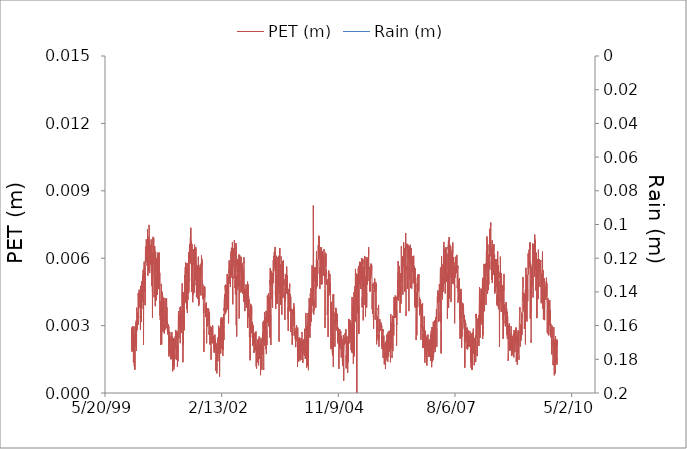
| Category | PET (m) |
|---|---|
| 36526.0 | 0.003 |
| 36527.0 | 0.003 |
| 36528.0 | 0.003 |
| 36529.0 | 0.002 |
| 36530.0 | 0.002 |
| 36531.0 | 0.003 |
| 36532.0 | 0.002 |
| 36533.0 | 0.003 |
| 36534.0 | 0.003 |
| 36535.0 | 0.002 |
| 36536.0 | 0.003 |
| 36537.0 | 0.003 |
| 36538.0 | 0.003 |
| 36539.0 | 0.002 |
| 36540.0 | 0.002 |
| 36541.0 | 0.002 |
| 36542.0 | 0.002 |
| 36543.0 | 0.002 |
| 36544.0 | 0.001 |
| 36545.0 | 0.003 |
| 36546.0 | 0.002 |
| 36547.0 | 0.002 |
| 36548.0 | 0.003 |
| 36549.0 | 0.002 |
| 36550.0 | 0.001 |
| 36551.0 | 0.001 |
| 36552.0 | 0.001 |
| 36553.0 | 0.001 |
| 36554.0 | 0.002 |
| 36555.0 | 0.003 |
| 36556.0 | 0.001 |
| 36557.0 | 0.002 |
| 36558.0 | 0.002 |
| 36559.0 | 0.003 |
| 36560.0 | 0.003 |
| 36561.0 | 0.002 |
| 36562.0 | 0.002 |
| 36563.0 | 0.003 |
| 36564.0 | 0.003 |
| 36565.0 | 0.003 |
| 36566.0 | 0.003 |
| 36567.0 | 0.003 |
| 36568.0 | 0.003 |
| 36569.0 | 0.003 |
| 36570.0 | 0.002 |
| 36571.0 | 0.003 |
| 36572.0 | 0.004 |
| 36573.0 | 0.004 |
| 36574.0 | 0.003 |
| 36575.0 | 0.003 |
| 36576.0 | 0.003 |
| 36577.0 | 0.003 |
| 36578.0 | 0.003 |
| 36579.0 | 0.003 |
| 36580.0 | 0.003 |
| 36581.0 | 0.004 |
| 36582.0 | 0.003 |
| 36583.0 | 0.003 |
| 36584.0 | 0.003 |
| 36585.0 | 0.004 |
| 36586.0 | 0.004 |
| 36587.0 | 0.004 |
| 36588.0 | 0.004 |
| 36589.0 | 0.004 |
| 36590.0 | 0.004 |
| 36591.0 | 0.004 |
| 36592.0 | 0.004 |
| 36593.0 | 0.005 |
| 36594.0 | 0.004 |
| 36595.0 | 0.004 |
| 36596.0 | 0.005 |
| 36597.0 | 0.004 |
| 36598.0 | 0.004 |
| 36599.0 | 0.004 |
| 36600.0 | 0.004 |
| 36601.0 | 0.004 |
| 36602.0 | 0.003 |
| 36603.0 | 0.003 |
| 36604.0 | 0.003 |
| 36605.0 | 0.005 |
| 36606.0 | 0.005 |
| 36607.0 | 0.004 |
| 36608.0 | 0.003 |
| 36609.0 | 0.004 |
| 36610.0 | 0.005 |
| 36611.0 | 0.003 |
| 36612.0 | 0.003 |
| 36613.0 | 0.004 |
| 36614.0 | 0.005 |
| 36615.0 | 0.004 |
| 36616.0 | 0.004 |
| 36617.0 | 0.004 |
| 36618.0 | 0.005 |
| 36619.0 | 0.004 |
| 36620.0 | 0.004 |
| 36621.0 | 0.004 |
| 36622.0 | 0.005 |
| 36623.0 | 0.005 |
| 36624.0 | 0.005 |
| 36625.0 | 0.004 |
| 36626.0 | 0.005 |
| 36627.0 | 0.005 |
| 36628.0 | 0.005 |
| 36629.0 | 0.005 |
| 36630.0 | 0.002 |
| 36631.0 | 0.004 |
| 36632.0 | 0.005 |
| 36633.0 | 0.005 |
| 36634.0 | 0.005 |
| 36635.0 | 0.006 |
| 36636.0 | 0.006 |
| 36637.0 | 0.005 |
| 36638.0 | 0.005 |
| 36639.0 | 0.005 |
| 36640.0 | 0.006 |
| 36641.0 | 0.005 |
| 36642.0 | 0.004 |
| 36643.0 | 0.005 |
| 36644.0 | 0.004 |
| 36645.0 | 0.005 |
| 36646.0 | 0.006 |
| 36647.0 | 0.007 |
| 36648.0 | 0.006 |
| 36649.0 | 0.006 |
| 36650.0 | 0.006 |
| 36651.0 | 0.006 |
| 36652.0 | 0.006 |
| 36653.0 | 0.006 |
| 36654.0 | 0.007 |
| 36655.0 | 0.006 |
| 36656.0 | 0.006 |
| 36657.0 | 0.006 |
| 36658.0 | 0.007 |
| 36659.0 | 0.007 |
| 36660.0 | 0.006 |
| 36661.0 | 0.006 |
| 36662.0 | 0.006 |
| 36663.0 | 0.007 |
| 36664.0 | 0.007 |
| 36665.0 | 0.007 |
| 36666.0 | 0.007 |
| 36667.0 | 0.006 |
| 36668.0 | 0.005 |
| 36669.0 | 0.006 |
| 36670.0 | 0.006 |
| 36671.0 | 0.006 |
| 36672.0 | 0.006 |
| 36673.0 | 0.007 |
| 36674.0 | 0.006 |
| 36675.0 | 0.006 |
| 36676.0 | 0.005 |
| 36677.0 | 0.006 |
| 36678.0 | 0.007 |
| 36679.0 | 0.007 |
| 36680.0 | 0.007 |
| 36681.0 | 0.007 |
| 36682.0 | 0.006 |
| 36683.0 | 0.005 |
| 36684.0 | 0.006 |
| 36685.0 | 0.007 |
| 36686.0 | 0.007 |
| 36687.0 | 0.007 |
| 36688.0 | 0.006 |
| 36689.0 | 0.006 |
| 36690.0 | 0.007 |
| 36691.0 | 0.006 |
| 36692.0 | 0.006 |
| 36693.0 | 0.007 |
| 36694.0 | 0.006 |
| 36695.0 | 0.006 |
| 36696.0 | 0.007 |
| 36697.0 | 0.006 |
| 36698.0 | 0.006 |
| 36699.0 | 0.005 |
| 36700.0 | 0.005 |
| 36701.0 | 0.006 |
| 36702.0 | 0.006 |
| 36703.0 | 0.005 |
| 36704.0 | 0.005 |
| 36705.0 | 0.006 |
| 36706.0 | 0.004 |
| 36707.0 | 0.003 |
| 36708.0 | 0.006 |
| 36709.0 | 0.006 |
| 36710.0 | 0.006 |
| 36711.0 | 0.006 |
| 36712.0 | 0.007 |
| 36713.0 | 0.006 |
| 36714.0 | 0.007 |
| 36715.0 | 0.006 |
| 36716.0 | 0.006 |
| 36717.0 | 0.007 |
| 36718.0 | 0.007 |
| 36719.0 | 0.005 |
| 36720.0 | 0.005 |
| 36721.0 | 0.004 |
| 36722.0 | 0.006 |
| 36723.0 | 0.006 |
| 36724.0 | 0.005 |
| 36725.0 | 0.006 |
| 36726.0 | 0.007 |
| 36727.0 | 0.006 |
| 36728.0 | 0.005 |
| 36729.0 | 0.005 |
| 36730.0 | 0.004 |
| 36731.0 | 0.004 |
| 36732.0 | 0.005 |
| 36733.0 | 0.006 |
| 36734.0 | 0.006 |
| 36735.0 | 0.006 |
| 36736.0 | 0.006 |
| 36737.0 | 0.006 |
| 36738.0 | 0.005 |
| 36739.0 | 0.005 |
| 36740.0 | 0.005 |
| 36741.0 | 0.004 |
| 36742.0 | 0.005 |
| 36743.0 | 0.006 |
| 36744.0 | 0.005 |
| 36745.0 | 0.006 |
| 36746.0 | 0.006 |
| 36747.0 | 0.006 |
| 36748.0 | 0.006 |
| 36749.0 | 0.005 |
| 36750.0 | 0.004 |
| 36751.0 | 0.005 |
| 36752.0 | 0.006 |
| 36753.0 | 0.006 |
| 36754.0 | 0.006 |
| 36755.0 | 0.006 |
| 36756.0 | 0.006 |
| 36757.0 | 0.005 |
| 36758.0 | 0.005 |
| 36759.0 | 0.005 |
| 36760.0 | 0.005 |
| 36761.0 | 0.006 |
| 36762.0 | 0.006 |
| 36763.0 | 0.006 |
| 36764.0 | 0.006 |
| 36765.0 | 0.006 |
| 36766.0 | 0.006 |
| 36767.0 | 0.005 |
| 36768.0 | 0.005 |
| 36769.0 | 0.005 |
| 36770.0 | 0.004 |
| 36771.0 | 0.003 |
| 36772.0 | 0.004 |
| 36773.0 | 0.004 |
| 36774.0 | 0.003 |
| 36775.0 | 0.004 |
| 36776.0 | 0.004 |
| 36777.0 | 0.004 |
| 36778.0 | 0.002 |
| 36779.0 | 0.004 |
| 36780.0 | 0.004 |
| 36781.0 | 0.005 |
| 36782.0 | 0.005 |
| 36783.0 | 0.005 |
| 36784.0 | 0.005 |
| 36785.0 | 0.004 |
| 36786.0 | 0.002 |
| 36787.0 | 0.003 |
| 36788.0 | 0.004 |
| 36789.0 | 0.005 |
| 36790.0 | 0.004 |
| 36791.0 | 0.003 |
| 36792.0 | 0.004 |
| 36793.0 | 0.004 |
| 36794.0 | 0.004 |
| 36795.0 | 0.004 |
| 36796.0 | 0.003 |
| 36797.0 | 0.004 |
| 36798.0 | 0.004 |
| 36799.0 | 0.003 |
| 36800.0 | 0.004 |
| 36801.0 | 0.004 |
| 36802.0 | 0.004 |
| 36803.0 | 0.004 |
| 36804.0 | 0.004 |
| 36805.0 | 0.004 |
| 36806.0 | 0.003 |
| 36807.0 | 0.003 |
| 36808.0 | 0.003 |
| 36809.0 | 0.003 |
| 36810.0 | 0.003 |
| 36811.0 | 0.004 |
| 36812.0 | 0.004 |
| 36813.0 | 0.004 |
| 36814.0 | 0.004 |
| 36815.0 | 0.004 |
| 36816.0 | 0.004 |
| 36817.0 | 0.004 |
| 36818.0 | 0.004 |
| 36819.0 | 0.003 |
| 36820.0 | 0.003 |
| 36821.0 | 0.003 |
| 36822.0 | 0.003 |
| 36823.0 | 0.003 |
| 36824.0 | 0.003 |
| 36825.0 | 0.004 |
| 36826.0 | 0.003 |
| 36827.0 | 0.004 |
| 36828.0 | 0.004 |
| 36829.0 | 0.003 |
| 36830.0 | 0.004 |
| 36831.0 | 0.003 |
| 36832.0 | 0.003 |
| 36833.0 | 0.003 |
| 36834.0 | 0.003 |
| 36835.0 | 0.003 |
| 36836.0 | 0.003 |
| 36837.0 | 0.003 |
| 36838.0 | 0.003 |
| 36839.0 | 0.003 |
| 36840.0 | 0.003 |
| 36841.0 | 0.003 |
| 36842.0 | 0.003 |
| 36843.0 | 0.003 |
| 36844.0 | 0.003 |
| 36845.0 | 0.002 |
| 36846.0 | 0.003 |
| 36847.0 | 0.003 |
| 36848.0 | 0.002 |
| 36849.0 | 0.003 |
| 36850.0 | 0.002 |
| 36851.0 | 0.002 |
| 36852.0 | 0.002 |
| 36853.0 | 0.002 |
| 36854.0 | 0.003 |
| 36855.0 | 0.002 |
| 36856.0 | 0.002 |
| 36857.0 | 0.002 |
| 36858.0 | 0.003 |
| 36859.0 | 0.002 |
| 36860.0 | 0.002 |
| 36861.0 | 0.002 |
| 36862.0 | 0.002 |
| 36863.0 | 0.002 |
| 36864.0 | 0.001 |
| 36865.0 | 0.002 |
| 36866.0 | 0.002 |
| 36867.0 | 0.002 |
| 36868.0 | 0.003 |
| 36869.0 | 0.002 |
| 36870.0 | 0.002 |
| 36871.0 | 0.002 |
| 36872.0 | 0.002 |
| 36873.0 | 0.003 |
| 36874.0 | 0.002 |
| 36875.0 | 0.002 |
| 36876.0 | 0.002 |
| 36877.0 | 0.002 |
| 36878.0 | 0.002 |
| 36879.0 | 0.001 |
| 36880.0 | 0.001 |
| 36881.0 | 0.002 |
| 36882.0 | 0.002 |
| 36883.0 | 0.002 |
| 36884.0 | 0.002 |
| 36885.0 | 0.002 |
| 36886.0 | 0.002 |
| 36887.0 | 0.002 |
| 36888.0 | 0.002 |
| 36889.0 | 0.001 |
| 36890.0 | 0.001 |
| 36891.0 | 0.001 |
| 36892.0 | 0.002 |
| 36893.0 | 0.001 |
| 36894.0 | 0.002 |
| 36895.0 | 0.001 |
| 36896.0 | 0.002 |
| 36897.0 | 0.002 |
| 36898.0 | 0.002 |
| 36899.0 | 0.002 |
| 36900.0 | 0.002 |
| 36901.0 | 0.002 |
| 36902.0 | 0.003 |
| 36903.0 | 0.002 |
| 36904.0 | 0.002 |
| 36905.0 | 0.002 |
| 36906.0 | 0.003 |
| 36907.0 | 0.003 |
| 36908.0 | 0.003 |
| 36909.0 | 0.002 |
| 36910.0 | 0.003 |
| 36911.0 | 0.002 |
| 36912.0 | 0.001 |
| 36913.0 | 0.002 |
| 36914.0 | 0.002 |
| 36915.0 | 0.002 |
| 36916.0 | 0.002 |
| 36917.0 | 0.002 |
| 36918.0 | 0.003 |
| 36919.0 | 0.003 |
| 36920.0 | 0.003 |
| 36921.0 | 0.001 |
| 36922.0 | 0.001 |
| 36923.0 | 0.001 |
| 36924.0 | 0.002 |
| 36925.0 | 0.002 |
| 36926.0 | 0.001 |
| 36927.0 | 0.003 |
| 36928.0 | 0.003 |
| 36929.0 | 0.004 |
| 36930.0 | 0.004 |
| 36931.0 | 0.004 |
| 36932.0 | 0.003 |
| 36933.0 | 0.002 |
| 36934.0 | 0.003 |
| 36935.0 | 0.003 |
| 36936.0 | 0.003 |
| 36937.0 | 0.004 |
| 36938.0 | 0.004 |
| 36939.0 | 0.003 |
| 36940.0 | 0.003 |
| 36941.0 | 0.003 |
| 36942.0 | 0.004 |
| 36943.0 | 0.004 |
| 36944.0 | 0.003 |
| 36945.0 | 0.002 |
| 36946.0 | 0.003 |
| 36947.0 | 0.003 |
| 36948.0 | 0.003 |
| 36949.0 | 0.004 |
| 36950.0 | 0.004 |
| 36951.0 | 0.003 |
| 36952.0 | 0.003 |
| 36953.0 | 0.004 |
| 36954.0 | 0.003 |
| 36955.0 | 0.003 |
| 36956.0 | 0.003 |
| 36957.0 | 0.003 |
| 36958.0 | 0.004 |
| 36959.0 | 0.004 |
| 36960.0 | 0.003 |
| 36961.0 | 0.004 |
| 36962.0 | 0.005 |
| 36963.0 | 0.004 |
| 36964.0 | 0.004 |
| 36965.0 | 0.004 |
| 36966.0 | 0.004 |
| 36967.0 | 0.003 |
| 36968.0 | 0.001 |
| 36969.0 | 0.002 |
| 36970.0 | 0.003 |
| 36971.0 | 0.002 |
| 36972.0 | 0.004 |
| 36973.0 | 0.004 |
| 36974.0 | 0.004 |
| 36975.0 | 0.003 |
| 36976.0 | 0.003 |
| 36977.0 | 0.003 |
| 36978.0 | 0.004 |
| 36979.0 | 0.003 |
| 36980.0 | 0.003 |
| 36981.0 | 0.004 |
| 36982.0 | 0.005 |
| 36983.0 | 0.005 |
| 36984.0 | 0.005 |
| 36985.0 | 0.005 |
| 36986.0 | 0.004 |
| 36987.0 | 0.005 |
| 36988.0 | 0.006 |
| 36989.0 | 0.005 |
| 36990.0 | 0.005 |
| 36991.0 | 0.005 |
| 36992.0 | 0.006 |
| 36993.0 | 0.006 |
| 36994.0 | 0.005 |
| 36995.0 | 0.004 |
| 36996.0 | 0.005 |
| 36997.0 | 0.005 |
| 36998.0 | 0.005 |
| 36999.0 | 0.004 |
| 37000.0 | 0.005 |
| 37001.0 | 0.006 |
| 37002.0 | 0.005 |
| 37003.0 | 0.005 |
| 37004.0 | 0.006 |
| 37005.0 | 0.005 |
| 37006.0 | 0.004 |
| 37007.0 | 0.004 |
| 37008.0 | 0.005 |
| 37009.0 | 0.005 |
| 37010.0 | 0.005 |
| 37011.0 | 0.004 |
| 37012.0 | 0.005 |
| 37013.0 | 0.005 |
| 37014.0 | 0.005 |
| 37015.0 | 0.005 |
| 37016.0 | 0.006 |
| 37017.0 | 0.006 |
| 37018.0 | 0.004 |
| 37019.0 | 0.005 |
| 37020.0 | 0.005 |
| 37021.0 | 0.006 |
| 37022.0 | 0.006 |
| 37023.0 | 0.006 |
| 37024.0 | 0.006 |
| 37025.0 | 0.007 |
| 37026.0 | 0.006 |
| 37027.0 | 0.007 |
| 37028.0 | 0.006 |
| 37029.0 | 0.006 |
| 37030.0 | 0.007 |
| 37031.0 | 0.006 |
| 37032.0 | 0.007 |
| 37033.0 | 0.006 |
| 37034.0 | 0.006 |
| 37035.0 | 0.007 |
| 37036.0 | 0.007 |
| 37037.0 | 0.006 |
| 37038.0 | 0.007 |
| 37039.0 | 0.007 |
| 37040.0 | 0.006 |
| 37041.0 | 0.005 |
| 37042.0 | 0.006 |
| 37043.0 | 0.005 |
| 37044.0 | 0.006 |
| 37045.0 | 0.006 |
| 37046.0 | 0.007 |
| 37047.0 | 0.007 |
| 37048.0 | 0.006 |
| 37049.0 | 0.006 |
| 37050.0 | 0.006 |
| 37051.0 | 0.005 |
| 37052.0 | 0.004 |
| 37053.0 | 0.005 |
| 37054.0 | 0.004 |
| 37055.0 | 0.005 |
| 37056.0 | 0.006 |
| 37057.0 | 0.006 |
| 37058.0 | 0.006 |
| 37059.0 | 0.006 |
| 37060.0 | 0.006 |
| 37061.0 | 0.006 |
| 37062.0 | 0.006 |
| 37063.0 | 0.006 |
| 37064.0 | 0.005 |
| 37065.0 | 0.004 |
| 37066.0 | 0.006 |
| 37067.0 | 0.006 |
| 37068.0 | 0.007 |
| 37069.0 | 0.006 |
| 37070.0 | 0.005 |
| 37071.0 | 0.005 |
| 37072.0 | 0.005 |
| 37073.0 | 0.006 |
| 37074.0 | 0.006 |
| 37075.0 | 0.006 |
| 37076.0 | 0.005 |
| 37077.0 | 0.006 |
| 37078.0 | 0.006 |
| 37079.0 | 0.006 |
| 37080.0 | 0.005 |
| 37081.0 | 0.006 |
| 37082.0 | 0.005 |
| 37083.0 | 0.004 |
| 37084.0 | 0.004 |
| 37085.0 | 0.005 |
| 37086.0 | 0.005 |
| 37087.0 | 0.005 |
| 37088.0 | 0.006 |
| 37089.0 | 0.006 |
| 37090.0 | 0.005 |
| 37091.0 | 0.005 |
| 37092.0 | 0.005 |
| 37093.0 | 0.004 |
| 37094.0 | 0.005 |
| 37095.0 | 0.005 |
| 37096.0 | 0.004 |
| 37097.0 | 0.006 |
| 37098.0 | 0.005 |
| 37099.0 | 0.005 |
| 37100.0 | 0.006 |
| 37101.0 | 0.006 |
| 37102.0 | 0.005 |
| 37103.0 | 0.004 |
| 37104.0 | 0.005 |
| 37105.0 | 0.004 |
| 37106.0 | 0.004 |
| 37107.0 | 0.005 |
| 37108.0 | 0.005 |
| 37109.0 | 0.005 |
| 37110.0 | 0.005 |
| 37111.0 | 0.006 |
| 37112.0 | 0.005 |
| 37113.0 | 0.005 |
| 37114.0 | 0.005 |
| 37115.0 | 0.006 |
| 37116.0 | 0.006 |
| 37117.0 | 0.005 |
| 37118.0 | 0.005 |
| 37119.0 | 0.006 |
| 37120.0 | 0.005 |
| 37121.0 | 0.005 |
| 37122.0 | 0.004 |
| 37123.0 | 0.005 |
| 37124.0 | 0.006 |
| 37125.0 | 0.006 |
| 37126.0 | 0.005 |
| 37127.0 | 0.006 |
| 37128.0 | 0.006 |
| 37129.0 | 0.006 |
| 37130.0 | 0.006 |
| 37131.0 | 0.006 |
| 37132.0 | 0.006 |
| 37133.0 | 0.006 |
| 37134.0 | 0.006 |
| 37135.0 | 0.005 |
| 37136.0 | 0.005 |
| 37137.0 | 0.004 |
| 37138.0 | 0.005 |
| 37139.0 | 0.005 |
| 37140.0 | 0.004 |
| 37141.0 | 0.004 |
| 37142.0 | 0.004 |
| 37143.0 | 0.004 |
| 37144.0 | 0.004 |
| 37145.0 | 0.004 |
| 37146.0 | 0.004 |
| 37147.0 | 0.003 |
| 37148.0 | 0.002 |
| 37149.0 | 0.003 |
| 37150.0 | 0.005 |
| 37151.0 | 0.005 |
| 37152.0 | 0.005 |
| 37153.0 | 0.005 |
| 37154.0 | 0.004 |
| 37155.0 | 0.005 |
| 37156.0 | 0.004 |
| 37157.0 | 0.004 |
| 37158.0 | 0.004 |
| 37159.0 | 0.004 |
| 37160.0 | 0.004 |
| 37161.0 | 0.004 |
| 37162.0 | 0.004 |
| 37163.0 | 0.003 |
| 37164.0 | 0.004 |
| 37165.0 | 0.004 |
| 37166.0 | 0.004 |
| 37167.0 | 0.004 |
| 37168.0 | 0.004 |
| 37169.0 | 0.004 |
| 37170.0 | 0.003 |
| 37171.0 | 0.002 |
| 37172.0 | 0.003 |
| 37173.0 | 0.003 |
| 37174.0 | 0.003 |
| 37175.0 | 0.003 |
| 37176.0 | 0.004 |
| 37177.0 | 0.003 |
| 37178.0 | 0.003 |
| 37179.0 | 0.003 |
| 37180.0 | 0.003 |
| 37181.0 | 0.003 |
| 37182.0 | 0.004 |
| 37183.0 | 0.004 |
| 37184.0 | 0.003 |
| 37185.0 | 0.003 |
| 37186.0 | 0.003 |
| 37187.0 | 0.003 |
| 37188.0 | 0.003 |
| 37189.0 | 0.004 |
| 37190.0 | 0.004 |
| 37191.0 | 0.003 |
| 37192.0 | 0.003 |
| 37193.0 | 0.003 |
| 37194.0 | 0.003 |
| 37195.0 | 0.003 |
| 37196.0 | 0.004 |
| 37197.0 | 0.003 |
| 37198.0 | 0.003 |
| 37199.0 | 0.002 |
| 37200.0 | 0.003 |
| 37201.0 | 0.003 |
| 37202.0 | 0.003 |
| 37203.0 | 0.003 |
| 37204.0 | 0.003 |
| 37205.0 | 0.003 |
| 37206.0 | 0.003 |
| 37207.0 | 0.003 |
| 37208.0 | 0.002 |
| 37209.0 | 0.001 |
| 37210.0 | 0.002 |
| 37211.0 | 0.003 |
| 37212.0 | 0.003 |
| 37213.0 | 0.003 |
| 37214.0 | 0.003 |
| 37215.0 | 0.003 |
| 37216.0 | 0.003 |
| 37217.0 | 0.003 |
| 37218.0 | 0.002 |
| 37219.0 | 0.003 |
| 37220.0 | 0.003 |
| 37221.0 | 0.003 |
| 37222.0 | 0.003 |
| 37223.0 | 0.003 |
| 37224.0 | 0.003 |
| 37225.0 | 0.003 |
| 37226.0 | 0.002 |
| 37227.0 | 0.003 |
| 37228.0 | 0.002 |
| 37229.0 | 0.002 |
| 37230.0 | 0.002 |
| 37231.0 | 0.003 |
| 37232.0 | 0.003 |
| 37233.0 | 0.002 |
| 37234.0 | 0.002 |
| 37235.0 | 0.002 |
| 37236.0 | 0.002 |
| 37237.0 | 0.002 |
| 37238.0 | 0.002 |
| 37239.0 | 0.002 |
| 37240.0 | 0.002 |
| 37241.0 | 0.002 |
| 37242.0 | 0.003 |
| 37243.0 | 0.002 |
| 37244.0 | 0.002 |
| 37245.0 | 0.002 |
| 37246.0 | 0.002 |
| 37247.0 | 0.002 |
| 37248.0 | 0.002 |
| 37249.0 | 0.002 |
| 37250.0 | 0.001 |
| 37251.0 | 0.001 |
| 37252.0 | 0.002 |
| 37253.0 | 0.002 |
| 37254.0 | 0.002 |
| 37255.0 | 0.002 |
| 37256.0 | 0.002 |
| 37257.0 | 0.002 |
| 37258.0 | 0.001 |
| 37259.0 | 0.001 |
| 37260.0 | 0.001 |
| 37261.0 | 0.002 |
| 37262.0 | 0.002 |
| 37263.0 | 0.001 |
| 37264.0 | 0.001 |
| 37265.0 | 0.002 |
| 37266.0 | 0.002 |
| 37267.0 | 0.002 |
| 37268.0 | 0.002 |
| 37269.0 | 0.002 |
| 37270.0 | 0.002 |
| 37271.0 | 0.002 |
| 37272.0 | 0.002 |
| 37273.0 | 0.003 |
| 37274.0 | 0.003 |
| 37275.0 | 0.003 |
| 37276.0 | 0.002 |
| 37277.0 | 0.002 |
| 37278.0 | 0.001 |
| 37279.0 | 0.003 |
| 37280.0 | 0.003 |
| 37281.0 | 0.002 |
| 37282.0 | 0.001 |
| 37283.0 | 0.002 |
| 37284.0 | 0.002 |
| 37285.0 | 0.002 |
| 37286.0 | 0.002 |
| 37287.0 | 0.002 |
| 37288.0 | 0.003 |
| 37289.0 | 0.003 |
| 37290.0 | 0.003 |
| 37291.0 | 0.002 |
| 37292.0 | 0.002 |
| 37293.0 | 0.003 |
| 37294.0 | 0.003 |
| 37295.0 | 0.002 |
| 37296.0 | 0.003 |
| 37297.0 | 0.002 |
| 37298.0 | 0.003 |
| 37299.0 | 0.003 |
| 37300.0 | 0.002 |
| 37301.0 | 0.002 |
| 37302.0 | 0.003 |
| 37303.0 | 0.003 |
| 37304.0 | 0.003 |
| 37305.0 | 0.003 |
| 37306.0 | 0.003 |
| 37307.0 | 0.003 |
| 37308.0 | 0.003 |
| 37309.0 | 0.002 |
| 37310.0 | 0.002 |
| 37311.0 | 0.003 |
| 37312.0 | 0.003 |
| 37313.0 | 0.003 |
| 37314.0 | 0.003 |
| 37315.0 | 0.002 |
| 37316.0 | 0.003 |
| 37317.0 | 0.003 |
| 37318.0 | 0.004 |
| 37319.0 | 0.002 |
| 37320.0 | 0.003 |
| 37321.0 | 0.004 |
| 37322.0 | 0.004 |
| 37323.0 | 0.004 |
| 37324.0 | 0.004 |
| 37325.0 | 0.004 |
| 37326.0 | 0.004 |
| 37327.0 | 0.004 |
| 37328.0 | 0.003 |
| 37329.0 | 0.004 |
| 37330.0 | 0.005 |
| 37331.0 | 0.005 |
| 37332.0 | 0.005 |
| 37333.0 | 0.005 |
| 37334.0 | 0.005 |
| 37335.0 | 0.004 |
| 37336.0 | 0.004 |
| 37337.0 | 0.004 |
| 37338.0 | 0.004 |
| 37339.0 | 0.005 |
| 37340.0 | 0.005 |
| 37341.0 | 0.005 |
| 37342.0 | 0.004 |
| 37343.0 | 0.005 |
| 37344.0 | 0.005 |
| 37345.0 | 0.005 |
| 37346.0 | 0.004 |
| 37347.0 | 0.004 |
| 37348.0 | 0.005 |
| 37349.0 | 0.004 |
| 37350.0 | 0.004 |
| 37351.0 | 0.004 |
| 37352.0 | 0.005 |
| 37353.0 | 0.005 |
| 37354.0 | 0.005 |
| 37355.0 | 0.005 |
| 37356.0 | 0.004 |
| 37357.0 | 0.004 |
| 37358.0 | 0.004 |
| 37359.0 | 0.003 |
| 37360.0 | 0.005 |
| 37361.0 | 0.005 |
| 37362.0 | 0.005 |
| 37363.0 | 0.005 |
| 37364.0 | 0.005 |
| 37365.0 | 0.006 |
| 37366.0 | 0.005 |
| 37367.0 | 0.006 |
| 37368.0 | 0.006 |
| 37369.0 | 0.005 |
| 37370.0 | 0.006 |
| 37371.0 | 0.005 |
| 37372.0 | 0.005 |
| 37373.0 | 0.005 |
| 37374.0 | 0.005 |
| 37375.0 | 0.005 |
| 37376.0 | 0.005 |
| 37377.0 | 0.005 |
| 37378.0 | 0.005 |
| 37379.0 | 0.006 |
| 37380.0 | 0.006 |
| 37381.0 | 0.005 |
| 37382.0 | 0.005 |
| 37383.0 | 0.006 |
| 37384.0 | 0.006 |
| 37385.0 | 0.006 |
| 37386.0 | 0.006 |
| 37387.0 | 0.006 |
| 37388.0 | 0.006 |
| 37389.0 | 0.005 |
| 37390.0 | 0.006 |
| 37391.0 | 0.006 |
| 37392.0 | 0.007 |
| 37393.0 | 0.006 |
| 37394.0 | 0.005 |
| 37395.0 | 0.004 |
| 37396.0 | 0.005 |
| 37397.0 | 0.005 |
| 37398.0 | 0.005 |
| 37399.0 | 0.005 |
| 37400.0 | 0.006 |
| 37401.0 | 0.006 |
| 37402.0 | 0.006 |
| 37403.0 | 0.006 |
| 37404.0 | 0.006 |
| 37405.0 | 0.006 |
| 37406.0 | 0.006 |
| 37407.0 | 0.006 |
| 37408.0 | 0.007 |
| 37409.0 | 0.007 |
| 37410.0 | 0.007 |
| 37411.0 | 0.006 |
| 37412.0 | 0.006 |
| 37413.0 | 0.005 |
| 37414.0 | 0.006 |
| 37415.0 | 0.005 |
| 37416.0 | 0.005 |
| 37417.0 | 0.005 |
| 37418.0 | 0.004 |
| 37419.0 | 0.006 |
| 37420.0 | 0.006 |
| 37421.0 | 0.006 |
| 37422.0 | 0.006 |
| 37423.0 | 0.007 |
| 37424.0 | 0.005 |
| 37425.0 | 0.003 |
| 37426.0 | 0.005 |
| 37427.0 | 0.005 |
| 37428.0 | 0.003 |
| 37429.0 | 0.003 |
| 37430.0 | 0.005 |
| 37431.0 | 0.005 |
| 37432.0 | 0.005 |
| 37433.0 | 0.005 |
| 37434.0 | 0.005 |
| 37435.0 | 0.006 |
| 37436.0 | 0.005 |
| 37437.0 | 0.005 |
| 37438.0 | 0.006 |
| 37439.0 | 0.006 |
| 37440.0 | 0.006 |
| 37441.0 | 0.005 |
| 37442.0 | 0.005 |
| 37443.0 | 0.006 |
| 37444.0 | 0.006 |
| 37445.0 | 0.005 |
| 37446.0 | 0.005 |
| 37447.0 | 0.005 |
| 37448.0 | 0.006 |
| 37449.0 | 0.005 |
| 37450.0 | 0.003 |
| 37451.0 | 0.005 |
| 37452.0 | 0.005 |
| 37453.0 | 0.006 |
| 37454.0 | 0.006 |
| 37455.0 | 0.006 |
| 37456.0 | 0.006 |
| 37457.0 | 0.005 |
| 37458.0 | 0.004 |
| 37459.0 | 0.005 |
| 37460.0 | 0.005 |
| 37461.0 | 0.005 |
| 37462.0 | 0.006 |
| 37463.0 | 0.006 |
| 37464.0 | 0.006 |
| 37465.0 | 0.006 |
| 37466.0 | 0.006 |
| 37467.0 | 0.006 |
| 37468.0 | 0.006 |
| 37469.0 | 0.005 |
| 37470.0 | 0.005 |
| 37471.0 | 0.005 |
| 37472.0 | 0.004 |
| 37473.0 | 0.005 |
| 37474.0 | 0.006 |
| 37475.0 | 0.005 |
| 37476.0 | 0.006 |
| 37477.0 | 0.006 |
| 37478.0 | 0.005 |
| 37479.0 | 0.006 |
| 37480.0 | 0.005 |
| 37481.0 | 0.004 |
| 37482.0 | 0.006 |
| 37483.0 | 0.005 |
| 37484.0 | 0.005 |
| 37485.0 | 0.005 |
| 37486.0 | 0.005 |
| 37487.0 | 0.005 |
| 37488.0 | 0.004 |
| 37489.0 | 0.005 |
| 37490.0 | 0.006 |
| 37491.0 | 0.006 |
| 37492.0 | 0.006 |
| 37493.0 | 0.006 |
| 37494.0 | 0.004 |
| 37495.0 | 0.004 |
| 37496.0 | 0.004 |
| 37497.0 | 0.005 |
| 37498.0 | 0.004 |
| 37499.0 | 0.004 |
| 37500.0 | 0.005 |
| 37501.0 | 0.004 |
| 37502.0 | 0.004 |
| 37503.0 | 0.004 |
| 37504.0 | 0.004 |
| 37505.0 | 0.004 |
| 37506.0 | 0.004 |
| 37507.0 | 0.004 |
| 37508.0 | 0.004 |
| 37509.0 | 0.005 |
| 37510.0 | 0.004 |
| 37511.0 | 0.004 |
| 37512.0 | 0.004 |
| 37513.0 | 0.004 |
| 37514.0 | 0.004 |
| 37515.0 | 0.005 |
| 37516.0 | 0.005 |
| 37517.0 | 0.005 |
| 37518.0 | 0.005 |
| 37519.0 | 0.004 |
| 37520.0 | 0.004 |
| 37521.0 | 0.005 |
| 37522.0 | 0.005 |
| 37523.0 | 0.003 |
| 37524.0 | 0.004 |
| 37525.0 | 0.004 |
| 37526.0 | 0.004 |
| 37527.0 | 0.005 |
| 37528.0 | 0.005 |
| 37529.0 | 0.004 |
| 37530.0 | 0.003 |
| 37531.0 | 0.004 |
| 37532.0 | 0.004 |
| 37533.0 | 0.004 |
| 37534.0 | 0.004 |
| 37535.0 | 0.004 |
| 37536.0 | 0.004 |
| 37537.0 | 0.004 |
| 37538.0 | 0.002 |
| 37539.0 | 0.003 |
| 37540.0 | 0.003 |
| 37541.0 | 0.004 |
| 37542.0 | 0.003 |
| 37543.0 | 0.003 |
| 37544.0 | 0.001 |
| 37545.0 | 0.003 |
| 37546.0 | 0.003 |
| 37547.0 | 0.003 |
| 37548.0 | 0.004 |
| 37549.0 | 0.004 |
| 37550.0 | 0.004 |
| 37551.0 | 0.004 |
| 37552.0 | 0.003 |
| 37553.0 | 0.003 |
| 37554.0 | 0.003 |
| 37555.0 | 0.003 |
| 37556.0 | 0.003 |
| 37557.0 | 0.004 |
| 37558.0 | 0.003 |
| 37559.0 | 0.003 |
| 37560.0 | 0.003 |
| 37561.0 | 0.003 |
| 37562.0 | 0.003 |
| 37563.0 | 0.002 |
| 37564.0 | 0.003 |
| 37565.0 | 0.003 |
| 37566.0 | 0.003 |
| 37567.0 | 0.002 |
| 37568.0 | 0.003 |
| 37569.0 | 0.003 |
| 37570.0 | 0.002 |
| 37571.0 | 0.002 |
| 37572.0 | 0.003 |
| 37573.0 | 0.002 |
| 37574.0 | 0.003 |
| 37575.0 | 0.002 |
| 37576.0 | 0.002 |
| 37577.0 | 0.002 |
| 37578.0 | 0.002 |
| 37579.0 | 0.002 |
| 37580.0 | 0.003 |
| 37581.0 | 0.002 |
| 37582.0 | 0.002 |
| 37583.0 | 0.002 |
| 37584.0 | 0.003 |
| 37585.0 | 0.002 |
| 37586.0 | 0.003 |
| 37587.0 | 0.003 |
| 37588.0 | 0.002 |
| 37589.0 | 0.002 |
| 37590.0 | 0.003 |
| 37591.0 | 0.002 |
| 37592.0 | 0.002 |
| 37593.0 | 0.002 |
| 37594.0 | 0.003 |
| 37595.0 | 0.002 |
| 37596.0 | 0.001 |
| 37597.0 | 0.002 |
| 37598.0 | 0.002 |
| 37599.0 | 0.001 |
| 37600.0 | 0.001 |
| 37601.0 | 0.002 |
| 37602.0 | 0.001 |
| 37603.0 | 0.002 |
| 37604.0 | 0.001 |
| 37605.0 | 0.001 |
| 37606.0 | 0.002 |
| 37607.0 | 0.002 |
| 37608.0 | 0.002 |
| 37609.0 | 0.002 |
| 37610.0 | 0.002 |
| 37611.0 | 0.002 |
| 37612.0 | 0.002 |
| 37613.0 | 0.002 |
| 37614.0 | 0.002 |
| 37615.0 | 0.002 |
| 37616.0 | 0.001 |
| 37617.0 | 0.002 |
| 37618.0 | 0.002 |
| 37619.0 | 0.002 |
| 37620.0 | 0.002 |
| 37621.0 | 0.003 |
| 37622.0 | 0.002 |
| 37623.0 | 0.002 |
| 37624.0 | 0.002 |
| 37625.0 | 0.002 |
| 37626.0 | 0.002 |
| 37627.0 | 0.002 |
| 37628.0 | 0.002 |
| 37629.0 | 0.002 |
| 37630.0 | 0.002 |
| 37631.0 | 0.002 |
| 37632.0 | 0.002 |
| 37633.0 | 0.001 |
| 37634.0 | 0.001 |
| 37635.0 | 0.002 |
| 37636.0 | 0.002 |
| 37637.0 | 0.002 |
| 37638.0 | 0.002 |
| 37639.0 | 0.001 |
| 37640.0 | 0.002 |
| 37641.0 | 0.002 |
| 37642.0 | 0.002 |
| 37643.0 | 0.002 |
| 37644.0 | 0.002 |
| 37645.0 | 0.001 |
| 37646.0 | 0.002 |
| 37647.0 | 0.002 |
| 37648.0 | 0.002 |
| 37649.0 | 0.002 |
| 37650.0 | 0.003 |
| 37651.0 | 0.003 |
| 37652.0 | 0.002 |
| 37653.0 | 0.002 |
| 37654.0 | 0.003 |
| 37655.0 | 0.003 |
| 37656.0 | 0.003 |
| 37657.0 | 0.002 |
| 37658.0 | 0.003 |
| 37659.0 | 0.003 |
| 37660.0 | 0.001 |
| 37661.0 | 0.001 |
| 37662.0 | 0.003 |
| 37663.0 | 0.002 |
| 37664.0 | 0.003 |
| 37665.0 | 0.003 |
| 37666.0 | 0.003 |
| 37667.0 | 0.004 |
| 37668.0 | 0.003 |
| 37669.0 | 0.002 |
| 37670.0 | 0.002 |
| 37671.0 | 0.003 |
| 37672.0 | 0.003 |
| 37673.0 | 0.003 |
| 37674.0 | 0.003 |
| 37675.0 | 0.003 |
| 37676.0 | 0.003 |
| 37677.0 | 0.003 |
| 37678.0 | 0.003 |
| 37679.0 | 0.003 |
| 37680.0 | 0.002 |
| 37681.0 | 0.004 |
| 37682.0 | 0.003 |
| 37683.0 | 0.002 |
| 37684.0 | 0.002 |
| 37685.0 | 0.004 |
| 37686.0 | 0.003 |
| 37687.0 | 0.003 |
| 37688.0 | 0.002 |
| 37689.0 | 0.003 |
| 37690.0 | 0.004 |
| 37691.0 | 0.004 |
| 37692.0 | 0.004 |
| 37693.0 | 0.004 |
| 37694.0 | 0.004 |
| 37695.0 | 0.003 |
| 37696.0 | 0.003 |
| 37697.0 | 0.003 |
| 37698.0 | 0.004 |
| 37699.0 | 0.004 |
| 37700.0 | 0.004 |
| 37701.0 | 0.004 |
| 37702.0 | 0.004 |
| 37703.0 | 0.003 |
| 37704.0 | 0.004 |
| 37705.0 | 0.004 |
| 37706.0 | 0.004 |
| 37707.0 | 0.003 |
| 37708.0 | 0.003 |
| 37709.0 | 0.004 |
| 37710.0 | 0.003 |
| 37711.0 | 0.002 |
| 37712.0 | 0.004 |
| 37713.0 | 0.005 |
| 37714.0 | 0.005 |
| 37715.0 | 0.005 |
| 37716.0 | 0.005 |
| 37717.0 | 0.006 |
| 37718.0 | 0.004 |
| 37719.0 | 0.004 |
| 37720.0 | 0.004 |
| 37721.0 | 0.002 |
| 37722.0 | 0.003 |
| 37723.0 | 0.005 |
| 37724.0 | 0.005 |
| 37725.0 | 0.005 |
| 37726.0 | 0.005 |
| 37727.0 | 0.005 |
| 37728.0 | 0.005 |
| 37729.0 | 0.005 |
| 37730.0 | 0.005 |
| 37731.0 | 0.004 |
| 37732.0 | 0.004 |
| 37733.0 | 0.005 |
| 37734.0 | 0.005 |
| 37735.0 | 0.005 |
| 37736.0 | 0.004 |
| 37737.0 | 0.005 |
| 37738.0 | 0.005 |
| 37739.0 | 0.005 |
| 37740.0 | 0.005 |
| 37741.0 | 0.005 |
| 37742.0 | 0.005 |
| 37743.0 | 0.006 |
| 37744.0 | 0.005 |
| 37745.0 | 0.006 |
| 37746.0 | 0.006 |
| 37747.0 | 0.006 |
| 37748.0 | 0.006 |
| 37749.0 | 0.006 |
| 37750.0 | 0.006 |
| 37751.0 | 0.006 |
| 37752.0 | 0.006 |
| 37753.0 | 0.006 |
| 37754.0 | 0.006 |
| 37755.0 | 0.006 |
| 37756.0 | 0.006 |
| 37757.0 | 0.006 |
| 37758.0 | 0.007 |
| 37759.0 | 0.005 |
| 37760.0 | 0.006 |
| 37761.0 | 0.004 |
| 37762.0 | 0.005 |
| 37763.0 | 0.004 |
| 37764.0 | 0.004 |
| 37765.0 | 0.005 |
| 37766.0 | 0.005 |
| 37767.0 | 0.006 |
| 37768.0 | 0.006 |
| 37769.0 | 0.005 |
| 37770.0 | 0.006 |
| 37771.0 | 0.006 |
| 37772.0 | 0.005 |
| 37773.0 | 0.004 |
| 37774.0 | 0.005 |
| 37775.0 | 0.005 |
| 37776.0 | 0.004 |
| 37777.0 | 0.005 |
| 37778.0 | 0.005 |
| 37779.0 | 0.005 |
| 37780.0 | 0.005 |
| 37781.0 | 0.006 |
| 37782.0 | 0.006 |
| 37783.0 | 0.006 |
| 37784.0 | 0.005 |
| 37785.0 | 0.005 |
| 37786.0 | 0.006 |
| 37787.0 | 0.006 |
| 37788.0 | 0.005 |
| 37789.0 | 0.005 |
| 37790.0 | 0.005 |
| 37791.0 | 0.004 |
| 37792.0 | 0.002 |
| 37793.0 | 0.005 |
| 37794.0 | 0.004 |
| 37795.0 | 0.005 |
| 37796.0 | 0.006 |
| 37797.0 | 0.006 |
| 37798.0 | 0.006 |
| 37799.0 | 0.006 |
| 37800.0 | 0.005 |
| 37801.0 | 0.005 |
| 37802.0 | 0.005 |
| 37803.0 | 0.005 |
| 37804.0 | 0.005 |
| 37805.0 | 0.004 |
| 37806.0 | 0.005 |
| 37807.0 | 0.006 |
| 37808.0 | 0.005 |
| 37809.0 | 0.005 |
| 37810.0 | 0.006 |
| 37811.0 | 0.006 |
| 37812.0 | 0.005 |
| 37813.0 | 0.005 |
| 37814.0 | 0.005 |
| 37815.0 | 0.003 |
| 37816.0 | 0.005 |
| 37817.0 | 0.004 |
| 37818.0 | 0.005 |
| 37819.0 | 0.005 |
| 37820.0 | 0.006 |
| 37821.0 | 0.006 |
| 37822.0 | 0.005 |
| 37823.0 | 0.005 |
| 37824.0 | 0.004 |
| 37825.0 | 0.005 |
| 37826.0 | 0.005 |
| 37827.0 | 0.005 |
| 37828.0 | 0.005 |
| 37829.0 | 0.006 |
| 37830.0 | 0.005 |
| 37831.0 | 0.005 |
| 37832.0 | 0.005 |
| 37833.0 | 0.005 |
| 37834.0 | 0.005 |
| 37835.0 | 0.004 |
| 37836.0 | 0.004 |
| 37837.0 | 0.004 |
| 37838.0 | 0.004 |
| 37839.0 | 0.004 |
| 37840.0 | 0.004 |
| 37841.0 | 0.004 |
| 37842.0 | 0.003 |
| 37843.0 | 0.004 |
| 37844.0 | 0.004 |
| 37845.0 | 0.004 |
| 37846.0 | 0.005 |
| 37847.0 | 0.004 |
| 37848.0 | 0.004 |
| 37849.0 | 0.005 |
| 37850.0 | 0.005 |
| 37851.0 | 0.005 |
| 37852.0 | 0.005 |
| 37853.0 | 0.005 |
| 37854.0 | 0.005 |
| 37855.0 | 0.004 |
| 37856.0 | 0.004 |
| 37857.0 | 0.006 |
| 37858.0 | 0.005 |
| 37859.0 | 0.005 |
| 37860.0 | 0.005 |
| 37861.0 | 0.005 |
| 37862.0 | 0.005 |
| 37863.0 | 0.005 |
| 37864.0 | 0.005 |
| 37865.0 | 0.004 |
| 37866.0 | 0.004 |
| 37867.0 | 0.004 |
| 37868.0 | 0.003 |
| 37869.0 | 0.003 |
| 37870.0 | 0.004 |
| 37871.0 | 0.003 |
| 37872.0 | 0.003 |
| 37873.0 | 0.004 |
| 37874.0 | 0.004 |
| 37875.0 | 0.004 |
| 37876.0 | 0.005 |
| 37877.0 | 0.005 |
| 37878.0 | 0.005 |
| 37879.0 | 0.004 |
| 37880.0 | 0.004 |
| 37881.0 | 0.004 |
| 37882.0 | 0.005 |
| 37883.0 | 0.005 |
| 37884.0 | 0.005 |
| 37885.0 | 0.004 |
| 37886.0 | 0.004 |
| 37887.0 | 0.004 |
| 37888.0 | 0.004 |
| 37889.0 | 0.004 |
| 37890.0 | 0.004 |
| 37891.0 | 0.004 |
| 37892.0 | 0.004 |
| 37893.0 | 0.003 |
| 37894.0 | 0.003 |
| 37895.0 | 0.003 |
| 37896.0 | 0.003 |
| 37897.0 | 0.003 |
| 37898.0 | 0.004 |
| 37899.0 | 0.004 |
| 37900.0 | 0.004 |
| 37901.0 | 0.003 |
| 37902.0 | 0.003 |
| 37903.0 | 0.003 |
| 37904.0 | 0.003 |
| 37905.0 | 0.002 |
| 37906.0 | 0.002 |
| 37907.0 | 0.003 |
| 37908.0 | 0.003 |
| 37909.0 | 0.003 |
| 37910.0 | 0.004 |
| 37911.0 | 0.003 |
| 37912.0 | 0.003 |
| 37913.0 | 0.003 |
| 37914.0 | 0.004 |
| 37915.0 | 0.004 |
| 37916.0 | 0.003 |
| 37917.0 | 0.003 |
| 37918.0 | 0.004 |
| 37919.0 | 0.004 |
| 37920.0 | 0.003 |
| 37921.0 | 0.003 |
| 37922.0 | 0.003 |
| 37923.0 | 0.003 |
| 37924.0 | 0.004 |
| 37925.0 | 0.003 |
| 37926.0 | 0.003 |
| 37927.0 | 0.003 |
| 37928.0 | 0.003 |
| 37929.0 | 0.003 |
| 37930.0 | 0.003 |
| 37931.0 | 0.002 |
| 37932.0 | 0.003 |
| 37933.0 | 0.003 |
| 37934.0 | 0.002 |
| 37935.0 | 0.002 |
| 37936.0 | 0.003 |
| 37937.0 | 0.003 |
| 37938.0 | 0.003 |
| 37939.0 | 0.003 |
| 37940.0 | 0.003 |
| 37941.0 | 0.003 |
| 37942.0 | 0.003 |
| 37943.0 | 0.003 |
| 37944.0 | 0.002 |
| 37945.0 | 0.002 |
| 37946.0 | 0.003 |
| 37947.0 | 0.003 |
| 37948.0 | 0.003 |
| 37949.0 | 0.003 |
| 37950.0 | 0.001 |
| 37951.0 | 0.002 |
| 37952.0 | 0.003 |
| 37953.0 | 0.003 |
| 37954.0 | 0.002 |
| 37955.0 | 0.002 |
| 37956.0 | 0.002 |
| 37957.0 | 0.002 |
| 37958.0 | 0.002 |
| 37959.0 | 0.002 |
| 37960.0 | 0.002 |
| 37961.0 | 0.001 |
| 37962.0 | 0.002 |
| 37963.0 | 0.002 |
| 37964.0 | 0.002 |
| 37965.0 | 0.002 |
| 37966.0 | 0.002 |
| 37967.0 | 0.002 |
| 37968.0 | 0.002 |
| 37969.0 | 0.002 |
| 37970.0 | 0.002 |
| 37971.0 | 0.002 |
| 37972.0 | 0.002 |
| 37973.0 | 0.002 |
| 37974.0 | 0.002 |
| 37975.0 | 0.001 |
| 37976.0 | 0.002 |
| 37977.0 | 0.002 |
| 37978.0 | 0.002 |
| 37979.0 | 0.002 |
| 37980.0 | 0.001 |
| 37981.0 | 0.002 |
| 37982.0 | 0.002 |
| 37983.0 | 0.002 |
| 37984.0 | 0.002 |
| 37985.0 | 0.002 |
| 37986.0 | 0.002 |
| 37987.0 | 0.002 |
| 37988.0 | 0.003 |
| 37989.0 | 0.003 |
| 37990.0 | 0.003 |
| 37991.0 | 0.002 |
| 37992.0 | 0.002 |
| 37993.0 | 0.001 |
| 37994.0 | 0.002 |
| 37995.0 | 0.002 |
| 37996.0 | 0.001 |
| 37997.0 | 0.002 |
| 37998.0 | 0.002 |
| 37999.0 | 0.002 |
| 38000.0 | 0.002 |
| 38001.0 | 0.002 |
| 38002.0 | 0.002 |
| 38003.0 | 0.002 |
| 38004.0 | 0.002 |
| 38005.0 | 0.002 |
| 38006.0 | 0.002 |
| 38007.0 | 0.002 |
| 38008.0 | 0.002 |
| 38009.0 | 0.002 |
| 38010.0 | 0.002 |
| 38011.0 | 0.003 |
| 38012.0 | 0.002 |
| 38013.0 | 0.002 |
| 38014.0 | 0.002 |
| 38015.0 | 0.002 |
| 38016.0 | 0.002 |
| 38017.0 | 0.002 |
| 38018.0 | 0.002 |
| 38019.0 | 0.002 |
| 38020.0 | 0.002 |
| 38021.0 | 0.003 |
| 38022.0 | 0.004 |
| 38023.0 | 0.003 |
| 38024.0 | 0.003 |
| 38025.0 | 0.002 |
| 38026.0 | 0.002 |
| 38027.0 | 0.002 |
| 38028.0 | 0.001 |
| 38029.0 | 0.003 |
| 38030.0 | 0.001 |
| 38031.0 | 0.002 |
| 38032.0 | 0.003 |
| 38033.0 | 0.002 |
| 38034.0 | 0.001 |
| 38035.0 | 0.002 |
| 38036.0 | 0.003 |
| 38037.0 | 0.003 |
| 38038.0 | 0.003 |
| 38039.0 | 0.003 |
| 38040.0 | 0.004 |
| 38041.0 | 0.002 |
| 38042.0 | 0.002 |
| 38043.0 | 0.001 |
| 38044.0 | 0.001 |
| 38045.0 | 0.002 |
| 38046.0 | 0.004 |
| 38047.0 | 0.004 |
| 38048.0 | 0.004 |
| 38049.0 | 0.004 |
| 38050.0 | 0.004 |
| 38051.0 | 0.004 |
| 38052.0 | 0.003 |
| 38053.0 | 0.004 |
| 38054.0 | 0.003 |
| 38055.0 | 0.004 |
| 38056.0 | 0.002 |
| 38057.0 | 0.004 |
| 38058.0 | 0.004 |
| 38059.0 | 0.004 |
| 38060.0 | 0.004 |
| 38061.0 | 0.004 |
| 38062.0 | 0.003 |
| 38063.0 | 0.004 |
| 38064.0 | 0.005 |
| 38065.0 | 0.005 |
| 38066.0 | 0.004 |
| 38067.0 | 0.004 |
| 38068.0 | 0.003 |
| 38069.0 | 0.003 |
| 38070.0 | 0.004 |
| 38071.0 | 0.004 |
| 38072.0 | 0.004 |
| 38073.0 | 0.004 |
| 38074.0 | 0.004 |
| 38075.0 | 0.006 |
| 38076.0 | 0.004 |
| 38077.0 | 0.004 |
| 38078.0 | 0.004 |
| 38079.0 | 0.004 |
| 38080.0 | 0.005 |
| 38081.0 | 0.005 |
| 38082.0 | 0.005 |
| 38083.0 | 0.005 |
| 38084.0 | 0.005 |
| 38085.0 | 0.004 |
| 38086.0 | 0.008 |
| 38087.0 | 0.007 |
| 38088.0 | 0.005 |
| 38089.0 | 0.003 |
| 38090.0 | 0.004 |
| 38091.0 | 0.004 |
| 38092.0 | 0.005 |
| 38093.0 | 0.005 |
| 38094.0 | 0.005 |
| 38095.0 | 0.005 |
| 38096.0 | 0.006 |
| 38097.0 | 0.005 |
| 38098.0 | 0.005 |
| 38099.0 | 0.005 |
| 38100.0 | 0.006 |
| 38101.0 | 0.006 |
| 38102.0 | 0.006 |
| 38103.0 | 0.005 |
| 38104.0 | 0.005 |
| 38105.0 | 0.006 |
| 38106.0 | 0.005 |
| 38107.0 | 0.004 |
| 38108.0 | 0.005 |
| 38109.0 | 0.005 |
| 38110.0 | 0.005 |
| 38111.0 | 0.005 |
| 38112.0 | 0.006 |
| 38113.0 | 0.006 |
| 38114.0 | 0.006 |
| 38115.0 | 0.006 |
| 38116.0 | 0.006 |
| 38117.0 | 0.006 |
| 38118.0 | 0.005 |
| 38119.0 | 0.005 |
| 38120.0 | 0.006 |
| 38121.0 | 0.006 |
| 38122.0 | 0.005 |
| 38123.0 | 0.005 |
| 38124.0 | 0.005 |
| 38125.0 | 0.006 |
| 38126.0 | 0.006 |
| 38127.0 | 0.006 |
| 38128.0 | 0.007 |
| 38129.0 | 0.006 |
| 38130.0 | 0.006 |
| 38131.0 | 0.006 |
| 38132.0 | 0.007 |
| 38133.0 | 0.006 |
| 38134.0 | 0.006 |
| 38135.0 | 0.006 |
| 38136.0 | 0.007 |
| 38137.0 | 0.007 |
| 38138.0 | 0.006 |
| 38139.0 | 0.006 |
| 38140.0 | 0.006 |
| 38141.0 | 0.006 |
| 38142.0 | 0.005 |
| 38143.0 | 0.006 |
| 38144.0 | 0.005 |
| 38145.0 | 0.006 |
| 38146.0 | 0.006 |
| 38147.0 | 0.005 |
| 38148.0 | 0.006 |
| 38149.0 | 0.006 |
| 38150.0 | 0.006 |
| 38151.0 | 0.006 |
| 38152.0 | 0.005 |
| 38153.0 | 0.005 |
| 38154.0 | 0.006 |
| 38155.0 | 0.006 |
| 38156.0 | 0.006 |
| 38157.0 | 0.006 |
| 38158.0 | 0.005 |
| 38159.0 | 0.005 |
| 38160.0 | 0.005 |
| 38161.0 | 0.005 |
| 38162.0 | 0.006 |
| 38163.0 | 0.006 |
| 38164.0 | 0.006 |
| 38165.0 | 0.006 |
| 38166.0 | 0.006 |
| 38167.0 | 0.006 |
| 38168.0 | 0.006 |
| 38169.0 | 0.006 |
| 38170.0 | 0.006 |
| 38171.0 | 0.005 |
| 38172.0 | 0.006 |
| 38173.0 | 0.006 |
| 38174.0 | 0.006 |
| 38175.0 | 0.006 |
| 38176.0 | 0.005 |
| 38177.0 | 0.006 |
| 38178.0 | 0.006 |
| 38179.0 | 0.006 |
| 38180.0 | 0.006 |
| 38181.0 | 0.005 |
| 38182.0 | 0.005 |
| 38183.0 | 0.005 |
| 38184.0 | 0.005 |
| 38185.0 | 0.005 |
| 38186.0 | 0.003 |
| 38187.0 | 0.005 |
| 38188.0 | 0.005 |
| 38189.0 | 0.006 |
| 38190.0 | 0.006 |
| 38191.0 | 0.006 |
| 38192.0 | 0.006 |
| 38193.0 | 0.006 |
| 38194.0 | 0.006 |
| 38195.0 | 0.006 |
| 38196.0 | 0.005 |
| 38197.0 | 0.005 |
| 38198.0 | 0.005 |
| 38199.0 | 0.005 |
| 38200.0 | 0.005 |
| 38201.0 | 0.005 |
| 38202.0 | 0.005 |
| 38203.0 | 0.005 |
| 38204.0 | 0.005 |
| 38205.0 | 0.005 |
| 38206.0 | 0.003 |
| 38207.0 | 0.004 |
| 38208.0 | 0.004 |
| 38209.0 | 0.004 |
| 38210.0 | 0.005 |
| 38211.0 | 0.004 |
| 38212.0 | 0.002 |
| 38213.0 | 0.003 |
| 38214.0 | 0.004 |
| 38215.0 | 0.005 |
| 38216.0 | 0.005 |
| 38217.0 | 0.005 |
| 38218.0 | 0.005 |
| 38219.0 | 0.005 |
| 38220.0 | 0.004 |
| 38221.0 | 0.005 |
| 38222.0 | 0.005 |
| 38223.0 | 0.005 |
| 38224.0 | 0.005 |
| 38225.0 | 0.005 |
| 38226.0 | 0.005 |
| 38227.0 | 0.005 |
| 38228.0 | 0.005 |
| 38229.0 | 0.005 |
| 38230.0 | 0.004 |
| 38231.0 | 0.005 |
| 38232.0 | 0.004 |
| 38233.0 | 0.004 |
| 38234.0 | 0.004 |
| 38235.0 | 0.003 |
| 38236.0 | 0.002 |
| 38237.0 | 0.003 |
| 38238.0 | 0.004 |
| 38239.0 | 0.004 |
| 38240.0 | 0.003 |
| 38241.0 | 0.003 |
| 38242.0 | 0.003 |
| 38243.0 | 0.004 |
| 38244.0 | 0.002 |
| 38245.0 | 0.002 |
| 38246.0 | 0.002 |
| 38247.0 | 0.002 |
| 38248.0 | 0.002 |
| 38249.0 | 0.002 |
| 38250.0 | 0.002 |
| 38251.0 | 0.003 |
| 38252.0 | 0.004 |
| 38253.0 | 0.004 |
| 38254.0 | 0.004 |
| 38255.0 | 0.003 |
| 38256.0 | 0.003 |
| 38257.0 | 0.001 |
| 38258.0 | 0.003 |
| 38259.0 | 0.004 |
| 38260.0 | 0.004 |
| 38261.0 | 0.004 |
| 38262.0 | 0.004 |
| 38263.0 | 0.003 |
| 38264.0 | 0.004 |
| 38265.0 | 0.003 |
| 38266.0 | 0.003 |
| 38267.0 | 0.003 |
| 38268.0 | 0.003 |
| 38269.0 | 0.003 |
| 38270.0 | 0.003 |
| 38271.0 | 0.002 |
| 38272.0 | 0.003 |
| 38273.0 | 0.003 |
| 38274.0 | 0.004 |
| 38275.0 | 0.003 |
| 38276.0 | 0.004 |
| 38277.0 | 0.004 |
| 38278.0 | 0.004 |
| 38279.0 | 0.004 |
| 38280.0 | 0.003 |
| 38281.0 | 0.003 |
| 38282.0 | 0.003 |
| 38283.0 | 0.003 |
| 38284.0 | 0.004 |
| 38285.0 | 0.003 |
| 38286.0 | 0.003 |
| 38287.0 | 0.003 |
| 38288.0 | 0.004 |
| 38289.0 | 0.003 |
| 38290.0 | 0.003 |
| 38291.0 | 0.004 |
| 38292.0 | 0.003 |
| 38293.0 | 0.003 |
| 38294.0 | 0.003 |
| 38295.0 | 0.003 |
| 38296.0 | 0.002 |
| 38297.0 | 0.002 |
| 38298.0 | 0.003 |
| 38299.0 | 0.003 |
| 38300.0 | 0.002 |
| 38301.0 | 0.003 |
| 38302.0 | 0.003 |
| 38303.0 | 0.002 |
| 38304.0 | 0.002 |
| 38305.0 | 0.001 |
| 38306.0 | 0.002 |
| 38307.0 | 0.003 |
| 38308.0 | 0.003 |
| 38309.0 | 0.003 |
| 38310.0 | 0.003 |
| 38311.0 | 0.002 |
| 38312.0 | 0.003 |
| 38313.0 | 0.003 |
| 38314.0 | 0.003 |
| 38315.0 | 0.003 |
| 38316.0 | 0.003 |
| 38317.0 | 0.002 |
| 38318.0 | 0.002 |
| 38319.0 | 0.002 |
| 38320.0 | 0.003 |
| 38321.0 | 0.002 |
| 38322.0 | 0.002 |
| 38323.0 | 0.002 |
| 38324.0 | 0.002 |
| 38325.0 | 0.002 |
| 38326.0 | 0.002 |
| 38327.0 | 0.003 |
| 38328.0 | 0.002 |
| 38329.0 | 0.002 |
| 38330.0 | 0.002 |
| 38331.0 | 0.002 |
| 38332.0 | 0.002 |
| 38333.0 | 0.002 |
| 38334.0 | 0.002 |
| 38335.0 | 0.001 |
| 38336.0 | 0.001 |
| 38337.0 | 0.002 |
| 38338.0 | 0.002 |
| 38339.0 | 0.002 |
| 38340.0 | 0.002 |
| 38341.0 | 0.001 |
| 38342.0 | 0.002 |
| 38343.0 | 0.003 |
| 38344.0 | 0.002 |
| 38345.0 | 0.001 |
| 38346.0 | 0.001 |
| 38347.0 | 0.001 |
| 38348.0 | 0.002 |
| 38349.0 | 0.002 |
| 38350.0 | 0.002 |
| 38351.0 | 0.002 |
| 38352.0 | 0.002 |
| 38353.0 | 0.002 |
| 38354.0 | 0.002 |
| 38355.0 | 0.002 |
| 38356.0 | 0.003 |
| 38357.0 | 0.003 |
| 38358.0 | 0.003 |
| 38359.0 | 0.002 |
| 38360.0 | 0.002 |
| 38361.0 | 0.003 |
| 38362.0 | 0.002 |
| 38363.0 | 0.002 |
| 38364.0 | 0.002 |
| 38365.0 | 0.003 |
| 38366.0 | 0.002 |
| 38367.0 | 0.001 |
| 38368.0 | 0.002 |
| 38369.0 | 0.001 |
| 38370.0 | 0.001 |
| 38371.0 | 0.002 |
| 38372.0 | 0.002 |
| 38373.0 | 0.003 |
| 38374.0 | 0.002 |
| 38375.0 | 0.002 |
| 38376.0 | 0.002 |
| 38377.0 | 0.002 |
| 38378.0 | 0.002 |
| 38379.0 | 0.002 |
| 38380.0 | 0.001 |
| 38381.0 | 0.002 |
| 38382.0 | 0.002 |
| 38383.0 | 0.001 |
| 38384.0 | 0.002 |
| 38385.0 | 0.002 |
| 38386.0 | 0.003 |
| 38387.0 | 0.002 |
| 38388.0 | 0.003 |
| 38389.0 | 0.003 |
| 38390.0 | 0.003 |
| 38391.0 | 0.003 |
| 38392.0 | 0.003 |
| 38393.0 | 0.003 |
| 38394.0 | 0.002 |
| 38395.0 | 0.003 |
| 38396.0 | 0.003 |
| 38397.0 | 0.003 |
| 38398.0 | 0.003 |
| 38399.0 | 0.003 |
| 38400.0 | 0.003 |
| 38401.0 | 0.003 |
| 38402.0 | 0.003 |
| 38403.0 | 0.003 |
| 38404.0 | 0.003 |
| 38405.0 | 0.003 |
| 38406.0 | 0.003 |
| 38407.0 | 0.002 |
| 38408.0 | 0.002 |
| 38409.0 | 0.002 |
| 38410.0 | 0.002 |
| 38411.0 | 0.003 |
| 38412.0 | 0.003 |
| 38413.0 | 0.003 |
| 38414.0 | 0.002 |
| 38415.0 | 0.003 |
| 38416.0 | 0.004 |
| 38417.0 | 0.004 |
| 38418.0 | 0.004 |
| 38419.0 | 0.003 |
| 38420.0 | 0.002 |
| 38421.0 | 0.003 |
| 38422.0 | 0.004 |
| 38423.0 | 0.004 |
| 38424.0 | 0.004 |
| 38425.0 | 0.003 |
| 38426.0 | 0.002 |
| 38427.0 | 0.003 |
| 38428.0 | 0.003 |
| 38429.0 | 0.001 |
| 38430.0 | 0.003 |
| 38431.0 | 0.004 |
| 38432.0 | 0.003 |
| 38433.0 | 0.004 |
| 38434.0 | 0.004 |
| 38435.0 | 0.004 |
| 38436.0 | 0.002 |
| 38437.0 | 0.002 |
| 38438.0 | 0.004 |
| 38439.0 | 0.003 |
| 38440.0 | 0.004 |
| 38441.0 | 0.005 |
| 38442.0 | 0.004 |
| 38443.0 | 0.005 |
| 38444.0 | 0.004 |
| 38445.0 | 0.004 |
| 38446.0 | 0.005 |
| 38447.0 | 0.006 |
| 38448.0 | 0.005 |
| 38449.0 | 0.003 |
| 38450.0 | 0.003 |
| 38451.0 | 0.005 |
| 38452.0 | 0.005 |
| 38453.0 | 0.005 |
| 38454.0 | 0.004 |
| 38455.0 | 0.004 |
| 38456.0 | 0.004 |
| 38457.0 | 0.004 |
| 38458.0 | 0 |
| 38459.0 | 0.005 |
| 38460.0 | 0.005 |
| 38461.0 | 0.005 |
| 38462.0 | 0.005 |
| 38463.0 | 0.005 |
| 38464.0 | 0.005 |
| 38465.0 | 0.004 |
| 38466.0 | 0.004 |
| 38467.0 | 0.005 |
| 38468.0 | 0.004 |
| 38469.0 | 0.004 |
| 38470.0 | 0.005 |
| 38471.0 | 0.006 |
| 38472.0 | 0.005 |
| 38473.0 | 0.003 |
| 38474.0 | 0.005 |
| 38475.0 | 0.006 |
| 38476.0 | 0.003 |
| 38477.0 | 0.003 |
| 38478.0 | 0.004 |
| 38479.0 | 0.005 |
| 38480.0 | 0.005 |
| 38481.0 | 0.005 |
| 38482.0 | 0.006 |
| 38483.0 | 0.005 |
| 38484.0 | 0.006 |
| 38485.0 | 0.006 |
| 38486.0 | 0.006 |
| 38487.0 | 0.006 |
| 38488.0 | 0.006 |
| 38489.0 | 0.006 |
| 38490.0 | 0.005 |
| 38491.0 | 0.005 |
| 38492.0 | 0.006 |
| 38493.0 | 0.005 |
| 38494.0 | 0.005 |
| 38495.0 | 0.006 |
| 38496.0 | 0.005 |
| 38497.0 | 0.005 |
| 38498.0 | 0.006 |
| 38499.0 | 0.006 |
| 38500.0 | 0.006 |
| 38501.0 | 0.006 |
| 38502.0 | 0.005 |
| 38503.0 | 0.004 |
| 38504.0 | 0.004 |
| 38505.0 | 0.004 |
| 38506.0 | 0.004 |
| 38507.0 | 0.004 |
| 38508.0 | 0.006 |
| 38509.0 | 0.006 |
| 38510.0 | 0.006 |
| 38511.0 | 0.006 |
| 38512.0 | 0.006 |
| 38513.0 | 0.003 |
| 38514.0 | 0.004 |
| 38515.0 | 0.004 |
| 38516.0 | 0.005 |
| 38517.0 | 0.005 |
| 38518.0 | 0.005 |
| 38519.0 | 0.006 |
| 38520.0 | 0.005 |
| 38521.0 | 0.005 |
| 38522.0 | 0.005 |
| 38523.0 | 0.005 |
| 38524.0 | 0.005 |
| 38525.0 | 0.006 |
| 38526.0 | 0.006 |
| 38527.0 | 0.005 |
| 38528.0 | 0.004 |
| 38529.0 | 0.005 |
| 38530.0 | 0.005 |
| 38531.0 | 0.004 |
| 38532.0 | 0.004 |
| 38533.0 | 0.003 |
| 38534.0 | 0.005 |
| 38535.0 | 0.005 |
| 38536.0 | 0.004 |
| 38537.0 | 0.005 |
| 38538.0 | 0.006 |
| 38539.0 | 0.006 |
| 38540.0 | 0.006 |
| 38541.0 | 0.006 |
| 38542.0 | 0.005 |
| 38543.0 | 0.004 |
| 38544.0 | 0.004 |
| 38545.0 | 0.005 |
| 38546.0 | 0.006 |
| 38547.0 | 0.005 |
| 38548.0 | 0.005 |
| 38549.0 | 0.006 |
| 38550.0 | 0.006 |
| 38551.0 | 0.006 |
| 38552.0 | 0.005 |
| 38553.0 | 0.006 |
| 38554.0 | 0.006 |
| 38555.0 | 0.006 |
| 38556.0 | 0.005 |
| 38557.0 | 0.005 |
| 38558.0 | 0.005 |
| 38559.0 | 0.006 |
| 38560.0 | 0.006 |
| 38561.0 | 0.006 |
| 38562.0 | 0.005 |
| 38563.0 | 0.005 |
| 38564.0 | 0.006 |
| 38565.0 | 0.005 |
| 38566.0 | 0.005 |
| 38567.0 | 0.005 |
| 38568.0 | 0.005 |
| 38569.0 | 0.005 |
| 38570.0 | 0.005 |
| 38571.0 | 0.005 |
| 38572.0 | 0.005 |
| 38573.0 | 0.005 |
| 38574.0 | 0.005 |
| 38575.0 | 0.005 |
| 38576.0 | 0.005 |
| 38577.0 | 0.005 |
| 38578.0 | 0.005 |
| 38579.0 | 0.005 |
| 38580.0 | 0.006 |
| 38581.0 | 0.006 |
| 38582.0 | 0.006 |
| 38583.0 | 0.006 |
| 38584.0 | 0.005 |
| 38585.0 | 0.006 |
| 38586.0 | 0.006 |
| 38587.0 | 0.005 |
| 38588.0 | 0.005 |
| 38589.0 | 0.005 |
| 38590.0 | 0.004 |
| 38591.0 | 0.004 |
| 38592.0 | 0.005 |
| 38593.0 | 0.004 |
| 38594.0 | 0.004 |
| 38595.0 | 0.004 |
| 38596.0 | 0.004 |
| 38597.0 | 0.005 |
| 38598.0 | 0.004 |
| 38599.0 | 0.004 |
| 38600.0 | 0.003 |
| 38601.0 | 0.003 |
| 38602.0 | 0.003 |
| 38603.0 | 0.003 |
| 38604.0 | 0.004 |
| 38605.0 | 0.005 |
| 38606.0 | 0.005 |
| 38607.0 | 0.005 |
| 38608.0 | 0.005 |
| 38609.0 | 0.004 |
| 38610.0 | 0.005 |
| 38611.0 | 0.005 |
| 38612.0 | 0.005 |
| 38613.0 | 0.005 |
| 38614.0 | 0.005 |
| 38615.0 | 0.004 |
| 38616.0 | 0.003 |
| 38617.0 | 0.004 |
| 38618.0 | 0.004 |
| 38619.0 | 0.004 |
| 38620.0 | 0.005 |
| 38621.0 | 0.005 |
| 38622.0 | 0.005 |
| 38623.0 | 0.005 |
| 38624.0 | 0.005 |
| 38625.0 | 0.005 |
| 38626.0 | 0.004 |
| 38627.0 | 0.003 |
| 38628.0 | 0.002 |
| 38629.0 | 0.003 |
| 38630.0 | 0.002 |
| 38631.0 | 0.003 |
| 38632.0 | 0.003 |
| 38633.0 | 0.003 |
| 38634.0 | 0.003 |
| 38635.0 | 0.003 |
| 38636.0 | 0.003 |
| 38637.0 | 0.003 |
| 38638.0 | 0.003 |
| 38639.0 | 0.003 |
| 38640.0 | 0.004 |
| 38641.0 | 0.004 |
| 38642.0 | 0.004 |
| 38643.0 | 0.004 |
| 38644.0 | 0.004 |
| 38645.0 | 0.004 |
| 38646.0 | 0.003 |
| 38647.0 | 0.003 |
| 38648.0 | 0.002 |
| 38649.0 | 0.003 |
| 38650.0 | 0.002 |
| 38651.0 | 0.003 |
| 38652.0 | 0.003 |
| 38653.0 | 0.003 |
| 38654.0 | 0.003 |
| 38655.0 | 0.003 |
| 38656.0 | 0.003 |
| 38657.0 | 0.003 |
| 38658.0 | 0.003 |
| 38659.0 | 0.003 |
| 38660.0 | 0.003 |
| 38661.0 | 0.003 |
| 38662.0 | 0.003 |
| 38663.0 | 0.003 |
| 38664.0 | 0.003 |
| 38665.0 | 0.003 |
| 38666.0 | 0.003 |
| 38667.0 | 0.003 |
| 38668.0 | 0.003 |
| 38669.0 | 0.003 |
| 38670.0 | 0.003 |
| 38671.0 | 0.003 |
| 38672.0 | 0.003 |
| 38673.0 | 0.002 |
| 38674.0 | 0.002 |
| 38675.0 | 0.003 |
| 38676.0 | 0.002 |
| 38677.0 | 0.002 |
| 38678.0 | 0.002 |
| 38679.0 | 0.002 |
| 38680.0 | 0.003 |
| 38681.0 | 0.003 |
| 38682.0 | 0.003 |
| 38683.0 | 0.002 |
| 38684.0 | 0.002 |
| 38685.0 | 0.002 |
| 38686.0 | 0.002 |
| 38687.0 | 0.002 |
| 38688.0 | 0.002 |
| 38689.0 | 0.002 |
| 38690.0 | 0.003 |
| 38691.0 | 0.002 |
| 38692.0 | 0.002 |
| 38693.0 | 0.002 |
| 38694.0 | 0.001 |
| 38695.0 | 0.002 |
| 38696.0 | 0.002 |
| 38697.0 | 0.002 |
| 38698.0 | 0.002 |
| 38699.0 | 0.002 |
| 38700.0 | 0.002 |
| 38701.0 | 0.002 |
| 38702.0 | 0.002 |
| 38703.0 | 0.002 |
| 38704.0 | 0.001 |
| 38705.0 | 0.001 |
| 38706.0 | 0.002 |
| 38707.0 | 0.001 |
| 38708.0 | 0.002 |
| 38709.0 | 0.002 |
| 38710.0 | 0.002 |
| 38711.0 | 0.002 |
| 38712.0 | 0.002 |
| 38713.0 | 0.002 |
| 38714.0 | 0.002 |
| 38715.0 | 0.002 |
| 38716.0 | 0.002 |
| 38717.0 | 0.003 |
| 38718.0 | 0.002 |
| 38719.0 | 0.002 |
| 38720.0 | 0.003 |
| 38721.0 | 0.002 |
| 38722.0 | 0.002 |
| 38723.0 | 0.001 |
| 38724.0 | 0.001 |
| 38725.0 | 0.002 |
| 38726.0 | 0.002 |
| 38727.0 | 0.003 |
| 38728.0 | 0.002 |
| 38729.0 | 0.003 |
| 38730.0 | 0.002 |
| 38731.0 | 0.002 |
| 38732.0 | 0.002 |
| 38733.0 | 0.002 |
| 38734.0 | 0.003 |
| 38735.0 | 0.002 |
| 38736.0 | 0.002 |
| 38737.0 | 0.003 |
| 38738.0 | 0.002 |
| 38739.0 | 0.002 |
| 38740.0 | 0.002 |
| 38741.0 | 0.003 |
| 38742.0 | 0.002 |
| 38743.0 | 0.002 |
| 38744.0 | 0.002 |
| 38745.0 | 0.002 |
| 38746.0 | 0.002 |
| 38747.0 | 0.001 |
| 38748.0 | 0.002 |
| 38749.0 | 0.003 |
| 38750.0 | 0.004 |
| 38751.0 | 0.002 |
| 38752.0 | 0.003 |
| 38753.0 | 0.002 |
| 38754.0 | 0.003 |
| 38755.0 | 0.003 |
| 38756.0 | 0.002 |
| 38757.0 | 0.002 |
| 38758.0 | 0.003 |
| 38759.0 | 0.002 |
| 38760.0 | 0.002 |
| 38761.0 | 0.002 |
| 38762.0 | 0.002 |
| 38763.0 | 0.003 |
| 38764.0 | 0.003 |
| 38765.0 | 0.003 |
| 38766.0 | 0.003 |
| 38767.0 | 0.002 |
| 38768.0 | 0.003 |
| 38769.0 | 0.003 |
| 38770.0 | 0.003 |
| 38771.0 | 0.003 |
| 38772.0 | 0.003 |
| 38773.0 | 0.003 |
| 38774.0 | 0.003 |
| 38775.0 | 0.003 |
| 38776.0 | 0.003 |
| 38777.0 | 0.004 |
| 38778.0 | 0.004 |
| 38779.0 | 0.004 |
| 38780.0 | 0.003 |
| 38781.0 | 0.004 |
| 38782.0 | 0.004 |
| 38783.0 | 0.003 |
| 38784.0 | 0.004 |
| 38785.0 | 0.004 |
| 38786.0 | 0.004 |
| 38787.0 | 0.004 |
| 38788.0 | 0.004 |
| 38789.0 | 0.004 |
| 38790.0 | 0.004 |
| 38791.0 | 0.003 |
| 38792.0 | 0.004 |
| 38793.0 | 0.004 |
| 38794.0 | 0.004 |
| 38795.0 | 0.004 |
| 38796.0 | 0.004 |
| 38797.0 | 0.004 |
| 38798.0 | 0.004 |
| 38799.0 | 0.002 |
| 38800.0 | 0.003 |
| 38801.0 | 0.003 |
| 38802.0 | 0.003 |
| 38803.0 | 0.004 |
| 38804.0 | 0.004 |
| 38805.0 | 0.004 |
| 38806.0 | 0.004 |
| 38807.0 | 0.005 |
| 38808.0 | 0.005 |
| 38809.0 | 0.005 |
| 38810.0 | 0.005 |
| 38811.0 | 0.005 |
| 38812.0 | 0.005 |
| 38813.0 | 0.006 |
| 38814.0 | 0.006 |
| 38815.0 | 0.005 |
| 38816.0 | 0.004 |
| 38817.0 | 0.004 |
| 38818.0 | 0.004 |
| 38819.0 | 0.005 |
| 38820.0 | 0.005 |
| 38821.0 | 0.006 |
| 38822.0 | 0.005 |
| 38823.0 | 0.005 |
| 38824.0 | 0.004 |
| 38825.0 | 0.005 |
| 38826.0 | 0.005 |
| 38827.0 | 0.005 |
| 38828.0 | 0.005 |
| 38829.0 | 0.004 |
| 38830.0 | 0.005 |
| 38831.0 | 0.005 |
| 38832.0 | 0.005 |
| 38833.0 | 0.004 |
| 38834.0 | 0.005 |
| 38835.0 | 0.005 |
| 38836.0 | 0.005 |
| 38837.0 | 0.004 |
| 38838.0 | 0.005 |
| 38839.0 | 0.006 |
| 38840.0 | 0.007 |
| 38841.0 | 0.006 |
| 38842.0 | 0.005 |
| 38843.0 | 0.005 |
| 38844.0 | 0.005 |
| 38845.0 | 0.005 |
| 38846.0 | 0.005 |
| 38847.0 | 0.005 |
| 38848.0 | 0.005 |
| 38849.0 | 0.005 |
| 38850.0 | 0.006 |
| 38851.0 | 0.006 |
| 38852.0 | 0.005 |
| 38853.0 | 0.004 |
| 38854.0 | 0.006 |
| 38855.0 | 0.006 |
| 38856.0 | 0.006 |
| 38857.0 | 0.006 |
| 38858.0 | 0.006 |
| 38859.0 | 0.007 |
| 38860.0 | 0.006 |
| 38861.0 | 0.006 |
| 38862.0 | 0.006 |
| 38863.0 | 0.006 |
| 38864.0 | 0.006 |
| 38865.0 | 0.006 |
| 38866.0 | 0.006 |
| 38867.0 | 0.006 |
| 38868.0 | 0.006 |
| 38869.0 | 0.005 |
| 38870.0 | 0.006 |
| 38871.0 | 0.005 |
| 38872.0 | 0.006 |
| 38873.0 | 0.006 |
| 38874.0 | 0.006 |
| 38875.0 | 0.007 |
| 38876.0 | 0.006 |
| 38877.0 | 0.007 |
| 38878.0 | 0.006 |
| 38879.0 | 0.006 |
| 38880.0 | 0.003 |
| 38881.0 | 0.004 |
| 38882.0 | 0.005 |
| 38883.0 | 0.005 |
| 38884.0 | 0.005 |
| 38885.0 | 0.006 |
| 38886.0 | 0.005 |
| 38887.0 | 0.006 |
| 38888.0 | 0.007 |
| 38889.0 | 0.006 |
| 38890.0 | 0.007 |
| 38891.0 | 0.006 |
| 38892.0 | 0.006 |
| 38893.0 | 0.005 |
| 38894.0 | 0.005 |
| 38895.0 | 0.005 |
| 38896.0 | 0.005 |
| 38897.0 | 0.006 |
| 38898.0 | 0.007 |
| 38899.0 | 0.007 |
| 38900.0 | 0.006 |
| 38901.0 | 0.006 |
| 38902.0 | 0.006 |
| 38903.0 | 0.006 |
| 38904.0 | 0.006 |
| 38905.0 | 0.004 |
| 38906.0 | 0.006 |
| 38907.0 | 0.006 |
| 38908.0 | 0.007 |
| 38909.0 | 0.006 |
| 38910.0 | 0.005 |
| 38911.0 | 0.006 |
| 38912.0 | 0.006 |
| 38913.0 | 0.006 |
| 38914.0 | 0.007 |
| 38915.0 | 0.006 |
| 38916.0 | 0.006 |
| 38917.0 | 0.007 |
| 38918.0 | 0.006 |
| 38919.0 | 0.006 |
| 38920.0 | 0.006 |
| 38921.0 | 0.005 |
| 38922.0 | 0.005 |
| 38923.0 | 0.006 |
| 38924.0 | 0.006 |
| 38925.0 | 0.006 |
| 38926.0 | 0.006 |
| 38927.0 | 0.006 |
| 38928.0 | 0.005 |
| 38929.0 | 0.005 |
| 38930.0 | 0.006 |
| 38931.0 | 0.006 |
| 38932.0 | 0.006 |
| 38933.0 | 0.006 |
| 38934.0 | 0.006 |
| 38935.0 | 0.006 |
| 38936.0 | 0.006 |
| 38937.0 | 0.006 |
| 38938.0 | 0.005 |
| 38939.0 | 0.006 |
| 38940.0 | 0.005 |
| 38941.0 | 0.006 |
| 38942.0 | 0.005 |
| 38943.0 | 0.005 |
| 38944.0 | 0.006 |
| 38945.0 | 0.006 |
| 38946.0 | 0.006 |
| 38947.0 | 0.005 |
| 38948.0 | 0.005 |
| 38949.0 | 0.005 |
| 38950.0 | 0.006 |
| 38951.0 | 0.005 |
| 38952.0 | 0.005 |
| 38953.0 | 0.004 |
| 38954.0 | 0.004 |
| 38955.0 | 0.005 |
| 38956.0 | 0.005 |
| 38957.0 | 0.005 |
| 38958.0 | 0.006 |
| 38959.0 | 0.004 |
| 38960.0 | 0.005 |
| 38961.0 | 0.005 |
| 38962.0 | 0.005 |
| 38963.0 | 0.005 |
| 38964.0 | 0.005 |
| 38965.0 | 0.005 |
| 38966.0 | 0.005 |
| 38967.0 | 0.002 |
| 38968.0 | 0.004 |
| 38969.0 | 0.004 |
| 38970.0 | 0.003 |
| 38971.0 | 0.004 |
| 38972.0 | 0.004 |
| 38973.0 | 0.003 |
| 38974.0 | 0.004 |
| 38975.0 | 0.005 |
| 38976.0 | 0.005 |
| 38977.0 | 0.005 |
| 38978.0 | 0.004 |
| 38979.0 | 0.004 |
| 38980.0 | 0.005 |
| 38981.0 | 0.005 |
| 38982.0 | 0.005 |
| 38983.0 | 0.005 |
| 38984.0 | 0.005 |
| 38985.0 | 0.005 |
| 38986.0 | 0.005 |
| 38987.0 | 0.005 |
| 38988.0 | 0.005 |
| 38989.0 | 0.005 |
| 38990.0 | 0.005 |
| 38991.0 | 0.005 |
| 38992.0 | 0.004 |
| 38993.0 | 0.004 |
| 38994.0 | 0.004 |
| 38995.0 | 0.004 |
| 38996.0 | 0.004 |
| 38997.0 | 0.004 |
| 38998.0 | 0.003 |
| 38999.0 | 0.004 |
| 39000.0 | 0.004 |
| 39001.0 | 0.004 |
| 39002.0 | 0.004 |
| 39003.0 | 0.004 |
| 39004.0 | 0.004 |
| 39005.0 | 0.004 |
| 39006.0 | 0.004 |
| 39007.0 | 0.003 |
| 39008.0 | 0.002 |
| 39009.0 | 0.003 |
| 39010.0 | 0.004 |
| 39011.0 | 0.004 |
| 39012.0 | 0.004 |
| 39013.0 | 0.003 |
| 39014.0 | 0.003 |
| 39015.0 | 0.003 |
| 39016.0 | 0.003 |
| 39017.0 | 0.003 |
| 39018.0 | 0.003 |
| 39019.0 | 0.003 |
| 39020.0 | 0.004 |
| 39021.0 | 0.004 |
| 39022.0 | 0.004 |
| 39023.0 | 0.003 |
| 39024.0 | 0.002 |
| 39025.0 | 0.003 |
| 39026.0 | 0.002 |
| 39027.0 | 0.002 |
| 39028.0 | 0.002 |
| 39029.0 | 0.002 |
| 39030.0 | 0.003 |
| 39031.0 | 0.003 |
| 39032.0 | 0.003 |
| 39033.0 | 0.002 |
| 39034.0 | 0.003 |
| 39035.0 | 0.003 |
| 39036.0 | 0.003 |
| 39037.0 | 0.002 |
| 39038.0 | 0.002 |
| 39039.0 | 0.002 |
| 39040.0 | 0.002 |
| 39041.0 | 0.002 |
| 39042.0 | 0.001 |
| 39043.0 | 0.001 |
| 39044.0 | 0.002 |
| 39045.0 | 0.003 |
| 39046.0 | 0.003 |
| 39047.0 | 0.003 |
| 39048.0 | 0.002 |
| 39049.0 | 0.002 |
| 39050.0 | 0.002 |
| 39051.0 | 0.003 |
| 39052.0 | 0.002 |
| 39053.0 | 0.002 |
| 39054.0 | 0.002 |
| 39055.0 | 0.002 |
| 39056.0 | 0.002 |
| 39057.0 | 0.002 |
| 39058.0 | 0.001 |
| 39059.0 | 0.001 |
| 39060.0 | 0.002 |
| 39061.0 | 0.002 |
| 39062.0 | 0.002 |
| 39063.0 | 0.002 |
| 39064.0 | 0.002 |
| 39065.0 | 0.002 |
| 39066.0 | 0.002 |
| 39067.0 | 0.002 |
| 39068.0 | 0.003 |
| 39069.0 | 0.002 |
| 39070.0 | 0.003 |
| 39071.0 | 0.002 |
| 39072.0 | 0.002 |
| 39073.0 | 0.002 |
| 39074.0 | 0.002 |
| 39075.0 | 0.002 |
| 39076.0 | 0.002 |
| 39077.0 | 0.002 |
| 39078.0 | 0.002 |
| 39079.0 | 0.002 |
| 39080.0 | 0.002 |
| 39081.0 | 0.002 |
| 39082.0 | 0.002 |
| 39083.0 | 0.002 |
| 39084.0 | 0.002 |
| 39085.0 | 0.002 |
| 39086.0 | 0.002 |
| 39087.0 | 0.002 |
| 39088.0 | 0.002 |
| 39089.0 | 0.002 |
| 39090.0 | 0.003 |
| 39091.0 | 0.002 |
| 39092.0 | 0.001 |
| 39093.0 | 0.002 |
| 39094.0 | 0.003 |
| 39095.0 | 0.003 |
| 39096.0 | 0.002 |
| 39097.0 | 0.003 |
| 39098.0 | 0.003 |
| 39099.0 | 0.001 |
| 39100.0 | 0.001 |
| 39101.0 | 0.002 |
| 39102.0 | 0.002 |
| 39103.0 | 0.003 |
| 39104.0 | 0.002 |
| 39105.0 | 0.001 |
| 39106.0 | 0.002 |
| 39107.0 | 0.002 |
| 39108.0 | 0.002 |
| 39109.0 | 0.003 |
| 39110.0 | 0.002 |
| 39111.0 | 0.001 |
| 39112.0 | 0.002 |
| 39113.0 | 0.002 |
| 39114.0 | 0.003 |
| 39115.0 | 0.003 |
| 39116.0 | 0.002 |
| 39117.0 | 0.002 |
| 39118.0 | 0.002 |
| 39119.0 | 0.002 |
| 39120.0 | 0.003 |
| 39121.0 | 0.003 |
| 39122.0 | 0.003 |
| 39123.0 | 0.002 |
| 39124.0 | 0.003 |
| 39125.0 | 0.003 |
| 39126.0 | 0.003 |
| 39127.0 | 0.003 |
| 39128.0 | 0.002 |
| 39129.0 | 0.002 |
| 39130.0 | 0.002 |
| 39131.0 | 0.002 |
| 39132.0 | 0.003 |
| 39133.0 | 0.003 |
| 39134.0 | 0.003 |
| 39135.0 | 0.003 |
| 39136.0 | 0.003 |
| 39137.0 | 0.003 |
| 39138.0 | 0.003 |
| 39139.0 | 0.003 |
| 39140.0 | 0.004 |
| 39141.0 | 0.004 |
| 39142.0 | 0.004 |
| 39143.0 | 0.003 |
| 39144.0 | 0.002 |
| 39145.0 | 0.003 |
| 39146.0 | 0.003 |
| 39147.0 | 0.004 |
| 39148.0 | 0.004 |
| 39149.0 | 0.004 |
| 39150.0 | 0.004 |
| 39151.0 | 0.004 |
| 39152.0 | 0.004 |
| 39153.0 | 0.005 |
| 39154.0 | 0.004 |
| 39155.0 | 0.004 |
| 39156.0 | 0.004 |
| 39157.0 | 0.003 |
| 39158.0 | 0.003 |
| 39159.0 | 0.003 |
| 39160.0 | 0.004 |
| 39161.0 | 0.004 |
| 39162.0 | 0.004 |
| 39163.0 | 0.004 |
| 39164.0 | 0.004 |
| 39165.0 | 0.005 |
| 39166.0 | 0.005 |
| 39167.0 | 0.005 |
| 39168.0 | 0.004 |
| 39169.0 | 0.005 |
| 39170.0 | 0.005 |
| 39171.0 | 0.003 |
| 39172.0 | 0.004 |
| 39173.0 | 0.005 |
| 39174.0 | 0.005 |
| 39175.0 | 0.006 |
| 39176.0 | 0.005 |
| 39177.0 | 0.003 |
| 39178.0 | 0.004 |
| 39179.0 | 0.003 |
| 39180.0 | 0.004 |
| 39181.0 | 0.002 |
| 39182.0 | 0.003 |
| 39183.0 | 0.005 |
| 39184.0 | 0.006 |
| 39185.0 | 0.006 |
| 39186.0 | 0.006 |
| 39187.0 | 0.005 |
| 39188.0 | 0.004 |
| 39189.0 | 0.005 |
| 39190.0 | 0.004 |
| 39191.0 | 0.005 |
| 39192.0 | 0.004 |
| 39193.0 | 0.005 |
| 39194.0 | 0.005 |
| 39195.0 | 0.006 |
| 39196.0 | 0.006 |
| 39197.0 | 0.005 |
| 39198.0 | 0.005 |
| 39199.0 | 0.005 |
| 39200.0 | 0.005 |
| 39201.0 | 0.006 |
| 39202.0 | 0.006 |
| 39203.0 | 0.007 |
| 39204.0 | 0.007 |
| 39205.0 | 0.007 |
| 39206.0 | 0.007 |
| 39207.0 | 0.005 |
| 39208.0 | 0.006 |
| 39209.0 | 0.005 |
| 39210.0 | 0.005 |
| 39211.0 | 0.005 |
| 39212.0 | 0.005 |
| 39213.0 | 0.006 |
| 39214.0 | 0.006 |
| 39215.0 | 0.005 |
| 39216.0 | 0.004 |
| 39217.0 | 0.005 |
| 39218.0 | 0.006 |
| 39219.0 | 0.006 |
| 39220.0 | 0.005 |
| 39221.0 | 0.005 |
| 39222.0 | 0.006 |
| 39223.0 | 0.006 |
| 39224.0 | 0.006 |
| 39225.0 | 0.006 |
| 39226.0 | 0.006 |
| 39227.0 | 0.005 |
| 39228.0 | 0.006 |
| 39229.0 | 0.006 |
| 39230.0 | 0.006 |
| 39231.0 | 0.006 |
| 39232.0 | 0.006 |
| 39233.0 | 0.006 |
| 39234.0 | 0.005 |
| 39235.0 | 0.003 |
| 39236.0 | 0.005 |
| 39237.0 | 0.005 |
| 39238.0 | 0.005 |
| 39239.0 | 0.006 |
| 39240.0 | 0.006 |
| 39241.0 | 0.007 |
| 39242.0 | 0.006 |
| 39243.0 | 0.007 |
| 39244.0 | 0.007 |
| 39245.0 | 0.004 |
| 39246.0 | 0.005 |
| 39247.0 | 0.005 |
| 39248.0 | 0.006 |
| 39249.0 | 0.006 |
| 39250.0 | 0.007 |
| 39251.0 | 0.007 |
| 39252.0 | 0.006 |
| 39253.0 | 0.004 |
| 39254.0 | 0.004 |
| 39255.0 | 0.006 |
| 39256.0 | 0.007 |
| 39257.0 | 0.006 |
| 39258.0 | 0.005 |
| 39259.0 | 0.006 |
| 39260.0 | 0.006 |
| 39261.0 | 0.006 |
| 39262.0 | 0.006 |
| 39263.0 | 0.007 |
| 39264.0 | 0.006 |
| 39265.0 | 0.005 |
| 39266.0 | 0.004 |
| 39267.0 | 0.004 |
| 39268.0 | 0.005 |
| 39269.0 | 0.006 |
| 39270.0 | 0.006 |
| 39271.0 | 0.006 |
| 39272.0 | 0.006 |
| 39273.0 | 0.006 |
| 39274.0 | 0.006 |
| 39275.0 | 0.005 |
| 39276.0 | 0.006 |
| 39277.0 | 0.005 |
| 39278.0 | 0.005 |
| 39279.0 | 0.006 |
| 39280.0 | 0.006 |
| 39281.0 | 0.007 |
| 39282.0 | 0.006 |
| 39283.0 | 0.006 |
| 39284.0 | 0.005 |
| 39285.0 | 0.005 |
| 39286.0 | 0.006 |
| 39287.0 | 0.005 |
| 39288.0 | 0.006 |
| 39289.0 | 0.006 |
| 39290.0 | 0.005 |
| 39291.0 | 0.005 |
| 39292.0 | 0.005 |
| 39293.0 | 0.006 |
| 39294.0 | 0.005 |
| 39295.0 | 0.005 |
| 39296.0 | 0.003 |
| 39297.0 | 0.003 |
| 39298.0 | 0.005 |
| 39299.0 | 0.006 |
| 39300.0 | 0.005 |
| 39301.0 | 0.006 |
| 39302.0 | 0.006 |
| 39303.0 | 0.006 |
| 39304.0 | 0.005 |
| 39305.0 | 0.005 |
| 39306.0 | 0.006 |
| 39307.0 | 0.005 |
| 39308.0 | 0.006 |
| 39309.0 | 0.006 |
| 39310.0 | 0.006 |
| 39311.0 | 0.006 |
| 39312.0 | 0.005 |
| 39313.0 | 0.006 |
| 39314.0 | 0.006 |
| 39315.0 | 0.006 |
| 39316.0 | 0.006 |
| 39317.0 | 0.006 |
| 39318.0 | 0.006 |
| 39319.0 | 0.005 |
| 39320.0 | 0.005 |
| 39321.0 | 0.005 |
| 39322.0 | 0.006 |
| 39323.0 | 0.006 |
| 39324.0 | 0.006 |
| 39325.0 | 0.005 |
| 39326.0 | 0.004 |
| 39327.0 | 0.004 |
| 39328.0 | 0.004 |
| 39329.0 | 0.005 |
| 39330.0 | 0.005 |
| 39331.0 | 0.005 |
| 39332.0 | 0.005 |
| 39333.0 | 0.004 |
| 39334.0 | 0.005 |
| 39335.0 | 0.005 |
| 39336.0 | 0.004 |
| 39337.0 | 0.005 |
| 39338.0 | 0.005 |
| 39339.0 | 0.005 |
| 39340.0 | 0.004 |
| 39341.0 | 0.005 |
| 39342.0 | 0.003 |
| 39343.0 | 0.004 |
| 39344.0 | 0.002 |
| 39345.0 | 0.004 |
| 39346.0 | 0.004 |
| 39347.0 | 0.004 |
| 39348.0 | 0.004 |
| 39349.0 | 0.004 |
| 39350.0 | 0.004 |
| 39351.0 | 0.004 |
| 39352.0 | 0.005 |
| 39353.0 | 0.005 |
| 39354.0 | 0.004 |
| 39355.0 | 0.004 |
| 39356.0 | 0.003 |
| 39357.0 | 0.002 |
| 39358.0 | 0.003 |
| 39359.0 | 0.003 |
| 39360.0 | 0.003 |
| 39361.0 | 0.003 |
| 39362.0 | 0.003 |
| 39363.0 | 0.003 |
| 39364.0 | 0.004 |
| 39365.0 | 0.004 |
| 39366.0 | 0.004 |
| 39367.0 | 0.004 |
| 39368.0 | 0.004 |
| 39369.0 | 0.004 |
| 39370.0 | 0.004 |
| 39371.0 | 0.003 |
| 39372.0 | 0.004 |
| 39373.0 | 0.004 |
| 39374.0 | 0.003 |
| 39375.0 | 0.003 |
| 39376.0 | 0.003 |
| 39377.0 | 0.003 |
| 39378.0 | 0.003 |
| 39379.0 | 0.003 |
| 39380.0 | 0.003 |
| 39381.0 | 0.002 |
| 39382.0 | 0.002 |
| 39383.0 | 0.003 |
| 39384.0 | 0.001 |
| 39385.0 | 0.003 |
| 39386.0 | 0.003 |
| 39387.0 | 0.003 |
| 39388.0 | 0.002 |
| 39389.0 | 0.003 |
| 39390.0 | 0.003 |
| 39391.0 | 0.003 |
| 39392.0 | 0.003 |
| 39393.0 | 0.002 |
| 39394.0 | 0.002 |
| 39395.0 | 0.002 |
| 39396.0 | 0.003 |
| 39397.0 | 0.003 |
| 39398.0 | 0.003 |
| 39399.0 | 0.003 |
| 39400.0 | 0.003 |
| 39401.0 | 0.003 |
| 39402.0 | 0.002 |
| 39403.0 | 0.003 |
| 39404.0 | 0.003 |
| 39405.0 | 0.003 |
| 39406.0 | 0.003 |
| 39407.0 | 0.003 |
| 39408.0 | 0.002 |
| 39409.0 | 0.002 |
| 39410.0 | 0.002 |
| 39411.0 | 0.003 |
| 39412.0 | 0.002 |
| 39413.0 | 0.002 |
| 39414.0 | 0.003 |
| 39415.0 | 0.002 |
| 39416.0 | 0.003 |
| 39417.0 | 0.002 |
| 39418.0 | 0.003 |
| 39419.0 | 0.003 |
| 39420.0 | 0.002 |
| 39421.0 | 0.002 |
| 39422.0 | 0.002 |
| 39423.0 | 0.002 |
| 39424.0 | 0.003 |
| 39425.0 | 0.003 |
| 39426.0 | 0.002 |
| 39427.0 | 0.003 |
| 39428.0 | 0.002 |
| 39429.0 | 0.003 |
| 39430.0 | 0.003 |
| 39431.0 | 0.003 |
| 39432.0 | 0.003 |
| 39433.0 | 0.001 |
| 39434.0 | 0.002 |
| 39435.0 | 0.002 |
| 39436.0 | 0.002 |
| 39437.0 | 0.002 |
| 39438.0 | 0.001 |
| 39439.0 | 0.002 |
| 39440.0 | 0.002 |
| 39441.0 | 0.001 |
| 39442.0 | 0.001 |
| 39443.0 | 0.003 |
| 39444.0 | 0.003 |
| 39445.0 | 0.002 |
| 39446.0 | 0.002 |
| 39447.0 | 0.002 |
| 39448.0 | 0.002 |
| 39449.0 | 0.001 |
| 39450.0 | 0.001 |
| 39451.0 | 0.002 |
| 39452.0 | 0.002 |
| 39453.0 | 0.002 |
| 39454.0 | 0.003 |
| 39455.0 | 0.002 |
| 39456.0 | 0.003 |
| 39457.0 | 0.003 |
| 39458.0 | 0.002 |
| 39459.0 | 0.002 |
| 39460.0 | 0.002 |
| 39461.0 | 0.002 |
| 39462.0 | 0.002 |
| 39463.0 | 0.002 |
| 39464.0 | 0.002 |
| 39465.0 | 0.001 |
| 39466.0 | 0.001 |
| 39467.0 | 0.001 |
| 39468.0 | 0.002 |
| 39469.0 | 0.002 |
| 39470.0 | 0.002 |
| 39471.0 | 0.002 |
| 39472.0 | 0.002 |
| 39473.0 | 0.002 |
| 39474.0 | 0.002 |
| 39475.0 | 0.002 |
| 39476.0 | 0.003 |
| 39477.0 | 0.001 |
| 39478.0 | 0.002 |
| 39479.0 | 0.004 |
| 39480.0 | 0.003 |
| 39481.0 | 0.003 |
| 39482.0 | 0.004 |
| 39483.0 | 0.003 |
| 39484.0 | 0.003 |
| 39485.0 | 0.002 |
| 39486.0 | 0.003 |
| 39487.0 | 0.003 |
| 39488.0 | 0.003 |
| 39489.0 | 0.003 |
| 39490.0 | 0.002 |
| 39491.0 | 0.002 |
| 39492.0 | 0.002 |
| 39493.0 | 0.002 |
| 39494.0 | 0.002 |
| 39495.0 | 0.002 |
| 39496.0 | 0.002 |
| 39497.0 | 0.003 |
| 39498.0 | 0.003 |
| 39499.0 | 0.003 |
| 39500.0 | 0.003 |
| 39501.0 | 0.003 |
| 39502.0 | 0.003 |
| 39503.0 | 0.003 |
| 39504.0 | 0.003 |
| 39505.0 | 0.002 |
| 39506.0 | 0.002 |
| 39507.0 | 0.004 |
| 39508.0 | 0.004 |
| 39509.0 | 0.004 |
| 39510.0 | 0.005 |
| 39511.0 | 0.003 |
| 39512.0 | 0.003 |
| 39513.0 | 0.004 |
| 39514.0 | 0.002 |
| 39515.0 | 0.004 |
| 39516.0 | 0.003 |
| 39517.0 | 0.004 |
| 39518.0 | 0.004 |
| 39519.0 | 0.004 |
| 39520.0 | 0.004 |
| 39521.0 | 0.003 |
| 39522.0 | 0.004 |
| 39523.0 | 0.005 |
| 39524.0 | 0.004 |
| 39525.0 | 0.004 |
| 39526.0 | 0.004 |
| 39527.0 | 0.004 |
| 39528.0 | 0.005 |
| 39529.0 | 0.004 |
| 39530.0 | 0.004 |
| 39531.0 | 0.003 |
| 39532.0 | 0.004 |
| 39533.0 | 0.004 |
| 39534.0 | 0.005 |
| 39535.0 | 0.005 |
| 39536.0 | 0.005 |
| 39537.0 | 0.002 |
| 39538.0 | 0.005 |
| 39539.0 | 0.003 |
| 39540.0 | 0.005 |
| 39541.0 | 0.005 |
| 39542.0 | 0.005 |
| 39543.0 | 0.005 |
| 39544.0 | 0.004 |
| 39545.0 | 0.004 |
| 39546.0 | 0.004 |
| 39547.0 | 0.005 |
| 39548.0 | 0.005 |
| 39549.0 | 0.006 |
| 39550.0 | 0.005 |
| 39551.0 | 0.005 |
| 39552.0 | 0.004 |
| 39553.0 | 0.004 |
| 39554.0 | 0.005 |
| 39555.0 | 0.006 |
| 39556.0 | 0.006 |
| 39557.0 | 0.005 |
| 39558.0 | 0.005 |
| 39559.0 | 0.005 |
| 39560.0 | 0.006 |
| 39561.0 | 0.005 |
| 39562.0 | 0.005 |
| 39563.0 | 0.005 |
| 39564.0 | 0.006 |
| 39565.0 | 0.005 |
| 39566.0 | 0.004 |
| 39567.0 | 0.005 |
| 39568.0 | 0.006 |
| 39569.0 | 0.006 |
| 39570.0 | 0.006 |
| 39571.0 | 0.006 |
| 39572.0 | 0.006 |
| 39573.0 | 0.006 |
| 39574.0 | 0.007 |
| 39575.0 | 0.006 |
| 39576.0 | 0.005 |
| 39577.0 | 0.005 |
| 39578.0 | 0.005 |
| 39579.0 | 0.004 |
| 39580.0 | 0.006 |
| 39581.0 | 0.007 |
| 39582.0 | 0.007 |
| 39583.0 | 0.006 |
| 39584.0 | 0.005 |
| 39585.0 | 0.005 |
| 39586.0 | 0.005 |
| 39587.0 | 0.006 |
| 39588.0 | 0.006 |
| 39589.0 | 0.005 |
| 39590.0 | 0.005 |
| 39591.0 | 0.005 |
| 39592.0 | 0.006 |
| 39593.0 | 0.006 |
| 39594.0 | 0.006 |
| 39595.0 | 0.006 |
| 39596.0 | 0.007 |
| 39597.0 | 0.007 |
| 39598.0 | 0.007 |
| 39599.0 | 0.007 |
| 39600.0 | 0.007 |
| 39601.0 | 0.007 |
| 39602.0 | 0.006 |
| 39603.0 | 0.007 |
| 39604.0 | 0.007 |
| 39605.0 | 0.007 |
| 39606.0 | 0.008 |
| 39607.0 | 0.008 |
| 39608.0 | 0.007 |
| 39609.0 | 0.006 |
| 39610.0 | 0.005 |
| 39611.0 | 0.006 |
| 39612.0 | 0.006 |
| 39613.0 | 0.006 |
| 39614.0 | 0.005 |
| 39615.0 | 0.005 |
| 39616.0 | 0.006 |
| 39617.0 | 0.006 |
| 39618.0 | 0.007 |
| 39619.0 | 0.007 |
| 39620.0 | 0.005 |
| 39621.0 | 0.006 |
| 39622.0 | 0.005 |
| 39623.0 | 0.006 |
| 39624.0 | 0.006 |
| 39625.0 | 0.007 |
| 39626.0 | 0.006 |
| 39627.0 | 0.006 |
| 39628.0 | 0.006 |
| 39629.0 | 0.005 |
| 39630.0 | 0.005 |
| 39631.0 | 0.006 |
| 39632.0 | 0.006 |
| 39633.0 | 0.007 |
| 39634.0 | 0.006 |
| 39635.0 | 0.005 |
| 39636.0 | 0.006 |
| 39637.0 | 0.006 |
| 39638.0 | 0.006 |
| 39639.0 | 0.006 |
| 39640.0 | 0.006 |
| 39641.0 | 0.004 |
| 39642.0 | 0.005 |
| 39643.0 | 0.006 |
| 39644.0 | 0.004 |
| 39645.0 | 0.005 |
| 39646.0 | 0.005 |
| 39647.0 | 0.006 |
| 39648.0 | 0.006 |
| 39649.0 | 0.006 |
| 39650.0 | 0.006 |
| 39651.0 | 0.006 |
| 39652.0 | 0.005 |
| 39653.0 | 0.006 |
| 39654.0 | 0.006 |
| 39655.0 | 0.006 |
| 39656.0 | 0.005 |
| 39657.0 | 0.005 |
| 39658.0 | 0.005 |
| 39659.0 | 0.004 |
| 39660.0 | 0.004 |
| 39661.0 | 0.004 |
| 39662.0 | 0.004 |
| 39663.0 | 0.005 |
| 39664.0 | 0.005 |
| 39665.0 | 0.006 |
| 39666.0 | 0.006 |
| 39667.0 | 0.006 |
| 39668.0 | 0.005 |
| 39669.0 | 0.006 |
| 39670.0 | 0.006 |
| 39671.0 | 0.005 |
| 39672.0 | 0.004 |
| 39673.0 | 0.005 |
| 39674.0 | 0.004 |
| 39675.0 | 0.005 |
| 39676.0 | 0.004 |
| 39677.0 | 0.005 |
| 39678.0 | 0.005 |
| 39679.0 | 0.004 |
| 39680.0 | 0.003 |
| 39681.0 | 0.002 |
| 39682.0 | 0.002 |
| 39683.0 | 0.004 |
| 39684.0 | 0.005 |
| 39685.0 | 0.005 |
| 39686.0 | 0.005 |
| 39687.0 | 0.005 |
| 39688.0 | 0.005 |
| 39689.0 | 0.006 |
| 39690.0 | 0.005 |
| 39691.0 | 0.004 |
| 39692.0 | 0.004 |
| 39693.0 | 0.004 |
| 39694.0 | 0.005 |
| 39695.0 | 0.005 |
| 39696.0 | 0.004 |
| 39697.0 | 0.005 |
| 39698.0 | 0.005 |
| 39699.0 | 0.005 |
| 39700.0 | 0.005 |
| 39701.0 | 0.004 |
| 39702.0 | 0.004 |
| 39703.0 | 0.004 |
| 39704.0 | 0.004 |
| 39705.0 | 0.005 |
| 39706.0 | 0.005 |
| 39707.0 | 0.005 |
| 39708.0 | 0.004 |
| 39709.0 | 0.004 |
| 39710.0 | 0.004 |
| 39711.0 | 0.003 |
| 39712.0 | 0.004 |
| 39713.0 | 0.002 |
| 39714.0 | 0.004 |
| 39715.0 | 0.004 |
| 39716.0 | 0.005 |
| 39717.0 | 0.005 |
| 39718.0 | 0.005 |
| 39719.0 | 0.005 |
| 39720.0 | 0.005 |
| 39721.0 | 0.005 |
| 39722.0 | 0.004 |
| 39723.0 | 0.004 |
| 39724.0 | 0.004 |
| 39725.0 | 0.004 |
| 39726.0 | 0.004 |
| 39727.0 | 0.003 |
| 39728.0 | 0.004 |
| 39729.0 | 0.003 |
| 39730.0 | 0.003 |
| 39731.0 | 0.003 |
| 39732.0 | 0.003 |
| 39733.0 | 0.003 |
| 39734.0 | 0.003 |
| 39735.0 | 0.003 |
| 39736.0 | 0.004 |
| 39737.0 | 0.004 |
| 39738.0 | 0.004 |
| 39739.0 | 0.003 |
| 39740.0 | 0.003 |
| 39741.0 | 0.003 |
| 39742.0 | 0.003 |
| 39743.0 | 0.004 |
| 39744.0 | 0.003 |
| 39745.0 | 0.003 |
| 39746.0 | 0.003 |
| 39747.0 | 0.003 |
| 39748.0 | 0.004 |
| 39749.0 | 0.002 |
| 39750.0 | 0.003 |
| 39751.0 | 0.003 |
| 39752.0 | 0.003 |
| 39753.0 | 0.003 |
| 39754.0 | 0.003 |
| 39755.0 | 0.002 |
| 39756.0 | 0.001 |
| 39757.0 | 0.002 |
| 39758.0 | 0.003 |
| 39759.0 | 0.003 |
| 39760.0 | 0.003 |
| 39761.0 | 0.003 |
| 39762.0 | 0.002 |
| 39763.0 | 0.003 |
| 39764.0 | 0.003 |
| 39765.0 | 0.003 |
| 39766.0 | 0.002 |
| 39767.0 | 0.003 |
| 39768.0 | 0.002 |
| 39769.0 | 0.002 |
| 39770.0 | 0.002 |
| 39771.0 | 0.002 |
| 39772.0 | 0.003 |
| 39773.0 | 0.002 |
| 39774.0 | 0.002 |
| 39775.0 | 0.002 |
| 39776.0 | 0.002 |
| 39777.0 | 0.003 |
| 39778.0 | 0.002 |
| 39779.0 | 0.003 |
| 39780.0 | 0.003 |
| 39781.0 | 0.003 |
| 39782.0 | 0.002 |
| 39783.0 | 0.002 |
| 39784.0 | 0.002 |
| 39785.0 | 0.002 |
| 39786.0 | 0.002 |
| 39787.0 | 0.002 |
| 39788.0 | 0.002 |
| 39789.0 | 0.002 |
| 39790.0 | 0.002 |
| 39791.0 | 0.003 |
| 39792.0 | 0.002 |
| 39793.0 | 0.002 |
| 39794.0 | 0.002 |
| 39795.0 | 0.002 |
| 39796.0 | 0.002 |
| 39797.0 | 0.002 |
| 39798.0 | 0.002 |
| 39799.0 | 0.002 |
| 39800.0 | 0.003 |
| 39801.0 | 0.002 |
| 39802.0 | 0.002 |
| 39803.0 | 0.002 |
| 39804.0 | 0.002 |
| 39805.0 | 0.002 |
| 39806.0 | 0.003 |
| 39807.0 | 0.002 |
| 39808.0 | 0.002 |
| 39809.0 | 0.002 |
| 39810.0 | 0.003 |
| 39811.0 | 0.003 |
| 39812.0 | 0.002 |
| 39813.0 | 0.002 |
| 39814.0 | 0.002 |
| 39815.0 | 0.003 |
| 39816.0 | 0.002 |
| 39817.0 | 0.003 |
| 39818.0 | 0.003 |
| 39819.0 | 0.002 |
| 39820.0 | 0.003 |
| 39821.0 | 0.003 |
| 39822.0 | 0.002 |
| 39823.0 | 0.003 |
| 39824.0 | 0.002 |
| 39825.0 | 0.001 |
| 39826.0 | 0.001 |
| 39827.0 | 0.002 |
| 39828.0 | 0.002 |
| 39829.0 | 0.001 |
| 39830.0 | 0.002 |
| 39831.0 | 0.002 |
| 39832.0 | 0.002 |
| 39833.0 | 0.002 |
| 39834.0 | 0.001 |
| 39835.0 | 0.002 |
| 39836.0 | 0.002 |
| 39837.0 | 0.003 |
| 39838.0 | 0.002 |
| 39839.0 | 0.003 |
| 39840.0 | 0.003 |
| 39841.0 | 0.002 |
| 39842.0 | 0.002 |
| 39843.0 | 0.002 |
| 39844.0 | 0.002 |
| 39845.0 | 0.003 |
| 39846.0 | 0.002 |
| 39847.0 | 0.002 |
| 39848.0 | 0.001 |
| 39849.0 | 0.002 |
| 39850.0 | 0.003 |
| 39851.0 | 0.003 |
| 39852.0 | 0.003 |
| 39853.0 | 0.003 |
| 39854.0 | 0.004 |
| 39855.0 | 0.004 |
| 39856.0 | 0.004 |
| 39857.0 | 0.004 |
| 39858.0 | 0.003 |
| 39859.0 | 0.002 |
| 39860.0 | 0.003 |
| 39861.0 | 0.003 |
| 39862.0 | 0.003 |
| 39863.0 | 0.003 |
| 39864.0 | 0.002 |
| 39865.0 | 0.003 |
| 39866.0 | 0.003 |
| 39867.0 | 0.002 |
| 39868.0 | 0.003 |
| 39869.0 | 0.003 |
| 39870.0 | 0.003 |
| 39871.0 | 0.004 |
| 39872.0 | 0.003 |
| 39873.0 | 0.003 |
| 39874.0 | 0.003 |
| 39875.0 | 0.003 |
| 39876.0 | 0.003 |
| 39877.0 | 0.004 |
| 39878.0 | 0.004 |
| 39879.0 | 0.005 |
| 39880.0 | 0.005 |
| 39881.0 | 0.005 |
| 39882.0 | 0.005 |
| 39883.0 | 0.005 |
| 39884.0 | 0.005 |
| 39885.0 | 0.004 |
| 39886.0 | 0.004 |
| 39887.0 | 0.004 |
| 39888.0 | 0.004 |
| 39889.0 | 0.004 |
| 39890.0 | 0.004 |
| 39891.0 | 0.004 |
| 39892.0 | 0.004 |
| 39893.0 | 0.004 |
| 39894.0 | 0.004 |
| 39895.0 | 0.003 |
| 39896.0 | 0.003 |
| 39897.0 | 0.004 |
| 39898.0 | 0.003 |
| 39899.0 | 0.003 |
| 39900.0 | 0.004 |
| 39901.0 | 0.004 |
| 39902.0 | 0.004 |
| 39903.0 | 0.005 |
| 39904.0 | 0.002 |
| 39905.0 | 0.004 |
| 39906.0 | 0.005 |
| 39907.0 | 0.005 |
| 39908.0 | 0.006 |
| 39909.0 | 0.005 |
| 39910.0 | 0.003 |
| 39911.0 | 0.004 |
| 39912.0 | 0.005 |
| 39913.0 | 0.005 |
| 39914.0 | 0.004 |
| 39915.0 | 0.005 |
| 39916.0 | 0.005 |
| 39917.0 | 0.003 |
| 39918.0 | 0.005 |
| 39919.0 | 0.005 |
| 39920.0 | 0.004 |
| 39921.0 | 0.005 |
| 39922.0 | 0.005 |
| 39923.0 | 0.004 |
| 39924.0 | 0.005 |
| 39925.0 | 0.005 |
| 39926.0 | 0.005 |
| 39927.0 | 0.006 |
| 39928.0 | 0.006 |
| 39929.0 | 0.005 |
| 39930.0 | 0.005 |
| 39931.0 | 0.005 |
| 39932.0 | 0.006 |
| 39933.0 | 0.006 |
| 39934.0 | 0.006 |
| 39935.0 | 0.006 |
| 39936.0 | 0.006 |
| 39937.0 | 0.006 |
| 39938.0 | 0.006 |
| 39939.0 | 0.006 |
| 39940.0 | 0.006 |
| 39941.0 | 0.007 |
| 39942.0 | 0.006 |
| 39943.0 | 0.007 |
| 39944.0 | 0.006 |
| 39945.0 | 0.003 |
| 39946.0 | 0.006 |
| 39947.0 | 0.006 |
| 39948.0 | 0.006 |
| 39949.0 | 0.006 |
| 39950.0 | 0.005 |
| 39951.0 | 0.003 |
| 39952.0 | 0.002 |
| 39953.0 | 0.002 |
| 39954.0 | 0.004 |
| 39955.0 | 0.004 |
| 39956.0 | 0.005 |
| 39957.0 | 0.005 |
| 39958.0 | 0.005 |
| 39959.0 | 0.005 |
| 39960.0 | 0.006 |
| 39961.0 | 0.005 |
| 39962.0 | 0.005 |
| 39963.0 | 0.005 |
| 39964.0 | 0.006 |
| 39965.0 | 0.007 |
| 39966.0 | 0.007 |
| 39967.0 | 0.006 |
| 39968.0 | 0.005 |
| 39969.0 | 0.004 |
| 39970.0 | 0.004 |
| 39971.0 | 0.005 |
| 39972.0 | 0.006 |
| 39973.0 | 0.007 |
| 39974.0 | 0.006 |
| 39975.0 | 0.007 |
| 39976.0 | 0.006 |
| 39977.0 | 0.006 |
| 39978.0 | 0.006 |
| 39979.0 | 0.006 |
| 39980.0 | 0.006 |
| 39981.0 | 0.006 |
| 39982.0 | 0.005 |
| 39983.0 | 0.007 |
| 39984.0 | 0.006 |
| 39985.0 | 0.006 |
| 39986.0 | 0.006 |
| 39987.0 | 0.006 |
| 39988.0 | 0.006 |
| 39989.0 | 0.007 |
| 39990.0 | 0.006 |
| 39991.0 | 0.005 |
| 39992.0 | 0.006 |
| 39993.0 | 0.005 |
| 39994.0 | 0.005 |
| 39995.0 | 0.006 |
| 39996.0 | 0.006 |
| 39997.0 | 0.006 |
| 39998.0 | 0.006 |
| 39999.0 | 0.006 |
| 40000.0 | 0.004 |
| 40001.0 | 0.004 |
| 40002.0 | 0.003 |
| 40003.0 | 0.004 |
| 40004.0 | 0.005 |
| 40005.0 | 0.005 |
| 40006.0 | 0.006 |
| 40007.0 | 0.006 |
| 40008.0 | 0.005 |
| 40009.0 | 0.005 |
| 40010.0 | 0.005 |
| 40011.0 | 0.005 |
| 40012.0 | 0.004 |
| 40013.0 | 0.005 |
| 40014.0 | 0.005 |
| 40015.0 | 0.006 |
| 40016.0 | 0.006 |
| 40017.0 | 0.006 |
| 40018.0 | 0.005 |
| 40019.0 | 0.006 |
| 40020.0 | 0.006 |
| 40021.0 | 0.006 |
| 40022.0 | 0.006 |
| 40023.0 | 0.006 |
| 40024.0 | 0.006 |
| 40025.0 | 0.005 |
| 40026.0 | 0.005 |
| 40027.0 | 0.005 |
| 40028.0 | 0.005 |
| 40029.0 | 0.005 |
| 40030.0 | 0.006 |
| 40031.0 | 0.005 |
| 40032.0 | 0.006 |
| 40033.0 | 0.006 |
| 40034.0 | 0.006 |
| 40035.0 | 0.006 |
| 40036.0 | 0.006 |
| 40037.0 | 0.005 |
| 40038.0 | 0.005 |
| 40039.0 | 0.004 |
| 40040.0 | 0.005 |
| 40041.0 | 0.005 |
| 40042.0 | 0.004 |
| 40043.0 | 0.005 |
| 40044.0 | 0.005 |
| 40045.0 | 0.005 |
| 40046.0 | 0.005 |
| 40047.0 | 0.004 |
| 40048.0 | 0.006 |
| 40049.0 | 0.006 |
| 40050.0 | 0.006 |
| 40051.0 | 0.005 |
| 40052.0 | 0.004 |
| 40053.0 | 0.004 |
| 40054.0 | 0.005 |
| 40055.0 | 0.005 |
| 40056.0 | 0.005 |
| 40057.0 | 0.004 |
| 40058.0 | 0.003 |
| 40059.0 | 0.004 |
| 40060.0 | 0.005 |
| 40061.0 | 0.004 |
| 40062.0 | 0.005 |
| 40063.0 | 0.004 |
| 40064.0 | 0.005 |
| 40065.0 | 0.005 |
| 40066.0 | 0.005 |
| 40067.0 | 0.005 |
| 40068.0 | 0.003 |
| 40069.0 | 0.004 |
| 40070.0 | 0.004 |
| 40071.0 | 0.004 |
| 40072.0 | 0.005 |
| 40073.0 | 0.004 |
| 40074.0 | 0.004 |
| 40075.0 | 0.005 |
| 40076.0 | 0.005 |
| 40077.0 | 0.004 |
| 40078.0 | 0.004 |
| 40079.0 | 0.005 |
| 40080.0 | 0.004 |
| 40081.0 | 0.005 |
| 40082.0 | 0.005 |
| 40083.0 | 0.005 |
| 40084.0 | 0.005 |
| 40085.0 | 0.005 |
| 40086.0 | 0.004 |
| 40087.0 | 0.005 |
| 40088.0 | 0.004 |
| 40089.0 | 0.004 |
| 40090.0 | 0.004 |
| 40091.0 | 0.003 |
| 40092.0 | 0.004 |
| 40093.0 | 0.004 |
| 40094.0 | 0.004 |
| 40095.0 | 0.004 |
| 40096.0 | 0.004 |
| 40097.0 | 0.004 |
| 40098.0 | 0.004 |
| 40099.0 | 0.003 |
| 40100.0 | 0.003 |
| 40101.0 | 0.003 |
| 40102.0 | 0.004 |
| 40103.0 | 0.003 |
| 40104.0 | 0.003 |
| 40105.0 | 0.003 |
| 40106.0 | 0.004 |
| 40107.0 | 0.004 |
| 40108.0 | 0.004 |
| 40109.0 | 0.004 |
| 40110.0 | 0.004 |
| 40111.0 | 0.003 |
| 40112.0 | 0.004 |
| 40113.0 | 0.003 |
| 40114.0 | 0.004 |
| 40115.0 | 0.004 |
| 40116.0 | 0.003 |
| 40117.0 | 0.004 |
| 40118.0 | 0.003 |
| 40119.0 | 0.003 |
| 40120.0 | 0.002 |
| 40121.0 | 0.003 |
| 40122.0 | 0.003 |
| 40123.0 | 0.003 |
| 40124.0 | 0.003 |
| 40125.0 | 0.003 |
| 40126.0 | 0.003 |
| 40127.0 | 0.002 |
| 40128.0 | 0.002 |
| 40129.0 | 0.002 |
| 40130.0 | 0.003 |
| 40131.0 | 0.003 |
| 40132.0 | 0.003 |
| 40133.0 | 0.003 |
| 40134.0 | 0.003 |
| 40135.0 | 0.003 |
| 40136.0 | 0.002 |
| 40137.0 | 0.003 |
| 40138.0 | 0.002 |
| 40139.0 | 0.002 |
| 40140.0 | 0.002 |
| 40141.0 | 0.001 |
| 40142.0 | 0.001 |
| 40143.0 | 0.002 |
| 40144.0 | 0.002 |
| 40145.0 | 0.002 |
| 40146.0 | 0.003 |
| 40147.0 | 0.003 |
| 40148.0 | 0.002 |
| 40149.0 | 0.002 |
| 40150.0 | 0.002 |
| 40151.0 | 0.001 |
| 40152.0 | 0.001 |
| 40153.0 | 0.002 |
| 40154.0 | 0.002 |
| 40155.0 | 0.002 |
| 40156.0 | 0.002 |
| 40157.0 | 0.002 |
| 40158.0 | 0.001 |
| 40159.0 | 0.002 |
| 40160.0 | 0.002 |
| 40161.0 | 0.002 |
| 40162.0 | 0.003 |
| 40163.0 | 0.001 |
| 40164.0 | 0.002 |
| 40165.0 | 0.002 |
| 40166.0 | 0.002 |
| 40167.0 | 0.001 |
| 40168.0 | 0.002 |
| 40169.0 | 0.002 |
| 40170.0 | 0.002 |
| 40171.0 | 0.002 |
| 40172.0 | 0.002 |
| 40173.0 | 0.001 |
| 40174.0 | 0.001 |
| 40175.0 | 0.002 |
| 40176.0 | 0.002 |
| 40177.0 | 0.002 |
| 40178.0 | 0.002 |